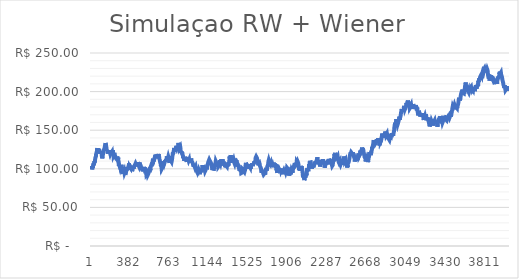
| Category | Fechamento |
|---|---|
| 0 | 100 |
| 1 | 100.678 |
| 2 | 101.698 |
| 3 | 103.433 |
| 4 | 103.872 |
| 5 | 103.301 |
| 6 | 101.942 |
| 7 | 103.253 |
| 8 | 103.356 |
| 9 | 101.671 |
| 10 | 101.156 |
| 11 | 99.206 |
| 12 | 100.505 |
| 13 | 101.097 |
| 14 | 102.596 |
| 15 | 101.179 |
| 16 | 101.984 |
| 17 | 101.192 |
| 18 | 102.281 |
| 19 | 103.791 |
| 20 | 104.23 |
| 21 | 105.191 |
| 22 | 104.655 |
| 23 | 105.236 |
| 24 | 105.897 |
| 25 | 107.164 |
| 26 | 106.026 |
| 27 | 106.317 |
| 28 | 104.596 |
| 29 | 106.191 |
| 30 | 106.873 |
| 31 | 107.87 |
| 32 | 109.868 |
| 33 | 109.879 |
| 34 | 110.602 |
| 35 | 109.348 |
| 36 | 108.08 |
| 37 | 108.624 |
| 38 | 110.357 |
| 39 | 111.676 |
| 40 | 113.385 |
| 41 | 112.103 |
| 42 | 113.96 |
| 43 | 114.763 |
| 44 | 116.02 |
| 45 | 115.441 |
| 46 | 114.342 |
| 47 | 116.233 |
| 48 | 117.494 |
| 49 | 119.403 |
| 50 | 118.268 |
| 51 | 119.61 |
| 52 | 118.437 |
| 53 | 118.722 |
| 54 | 120.002 |
| 55 | 121.327 |
| 56 | 122.898 |
| 57 | 124.658 |
| 58 | 124.891 |
| 59 | 125.276 |
| 60 | 124.724 |
| 61 | 126.733 |
| 62 | 124.752 |
| 63 | 125.297 |
| 64 | 125.624 |
| 65 | 126.227 |
| 66 | 125.505 |
| 67 | 123.505 |
| 68 | 123.481 |
| 69 | 124.017 |
| 70 | 125.82 |
| 71 | 125.696 |
| 72 | 126.794 |
| 73 | 125.202 |
| 74 | 124.043 |
| 75 | 125.571 |
| 76 | 124.817 |
| 77 | 123.172 |
| 78 | 123.15 |
| 79 | 121.484 |
| 80 | 123.319 |
| 81 | 123.75 |
| 82 | 122.032 |
| 83 | 120.021 |
| 84 | 121.251 |
| 85 | 122.398 |
| 86 | 121.001 |
| 87 | 122.127 |
| 88 | 122.635 |
| 89 | 121.314 |
| 90 | 119.693 |
| 91 | 119.584 |
| 92 | 121.089 |
| 93 | 121.943 |
| 94 | 122.648 |
| 95 | 122.152 |
| 96 | 121.419 |
| 97 | 119.929 |
| 98 | 121.319 |
| 99 | 122.203 |
| 100 | 121.799 |
| 101 | 120.358 |
| 102 | 119.289 |
| 103 | 117.47 |
| 104 | 116.641 |
| 105 | 115.022 |
| 106 | 115.317 |
| 107 | 115.263 |
| 108 | 113.5 |
| 109 | 113.595 |
| 110 | 114.258 |
| 111 | 115.963 |
| 112 | 114.995 |
| 113 | 116.836 |
| 114 | 118.106 |
| 115 | 119.317 |
| 116 | 120.338 |
| 117 | 120.739 |
| 118 | 121.987 |
| 119 | 123.675 |
| 120 | 124.17 |
| 121 | 122.577 |
| 122 | 123.824 |
| 123 | 123.644 |
| 124 | 124.126 |
| 125 | 124.169 |
| 126 | 123.494 |
| 127 | 124.7 |
| 128 | 124.592 |
| 129 | 126.154 |
| 130 | 125.215 |
| 131 | 126.536 |
| 132 | 127.904 |
| 133 | 129.175 |
| 134 | 129.635 |
| 135 | 129.026 |
| 136 | 129.745 |
| 137 | 131.734 |
| 138 | 131.52 |
| 139 | 133.255 |
| 140 | 133.114 |
| 141 | 132.006 |
| 142 | 132.341 |
| 143 | 131.65 |
| 144 | 131.845 |
| 145 | 130.958 |
| 146 | 129.075 |
| 147 | 128.301 |
| 148 | 128.096 |
| 149 | 126.454 |
| 150 | 126.36 |
| 151 | 124.354 |
| 152 | 123.926 |
| 153 | 123.682 |
| 154 | 123.106 |
| 155 | 123.586 |
| 156 | 123.882 |
| 157 | 123.043 |
| 158 | 121.801 |
| 159 | 121.133 |
| 160 | 120.658 |
| 161 | 119.582 |
| 162 | 119.525 |
| 163 | 120.611 |
| 164 | 122.016 |
| 165 | 123.812 |
| 166 | 123.919 |
| 167 | 123.904 |
| 168 | 122.64 |
| 169 | 121.194 |
| 170 | 122.015 |
| 171 | 122.46 |
| 172 | 123.958 |
| 173 | 123.42 |
| 174 | 121.669 |
| 175 | 120.943 |
| 176 | 122.401 |
| 177 | 121.894 |
| 178 | 121.79 |
| 179 | 120.042 |
| 180 | 121.715 |
| 181 | 122.954 |
| 182 | 121.709 |
| 183 | 120.311 |
| 184 | 120.822 |
| 185 | 119.559 |
| 186 | 121.342 |
| 187 | 122.167 |
| 188 | 124.16 |
| 189 | 122.864 |
| 190 | 123.287 |
| 191 | 121.409 |
| 192 | 120.084 |
| 193 | 118.855 |
| 194 | 120.482 |
| 195 | 121.276 |
| 196 | 121.236 |
| 197 | 119.39 |
| 198 | 119.529 |
| 199 | 119.344 |
| 200 | 120.293 |
| 201 | 121.98 |
| 202 | 120.338 |
| 203 | 119.539 |
| 204 | 120.787 |
| 205 | 122.228 |
| 206 | 123.287 |
| 207 | 124.089 |
| 208 | 122.245 |
| 209 | 123.197 |
| 210 | 124.138 |
| 211 | 122.376 |
| 212 | 120.406 |
| 213 | 120.23 |
| 214 | 119.335 |
| 215 | 118.673 |
| 216 | 116.996 |
| 217 | 117.19 |
| 218 | 115.978 |
| 219 | 116.497 |
| 220 | 117.972 |
| 221 | 117.925 |
| 222 | 118.659 |
| 223 | 120.413 |
| 224 | 119.272 |
| 225 | 120.896 |
| 226 | 120.001 |
| 227 | 118.43 |
| 228 | 119.283 |
| 229 | 118.588 |
| 230 | 118.789 |
| 231 | 117.953 |
| 232 | 116.86 |
| 233 | 115.868 |
| 234 | 114.472 |
| 235 | 114.636 |
| 236 | 113.908 |
| 237 | 113.442 |
| 238 | 114.552 |
| 239 | 115.023 |
| 240 | 113.21 |
| 241 | 113.61 |
| 242 | 114.024 |
| 243 | 114.531 |
| 244 | 112.897 |
| 245 | 114.494 |
| 246 | 113.009 |
| 247 | 114.684 |
| 248 | 113.835 |
| 249 | 114.776 |
| 250 | 113.97 |
| 251 | 112.842 |
| 252 | 114.422 |
| 253 | 115.983 |
| 254 | 114.115 |
| 255 | 112.88 |
| 256 | 114.476 |
| 257 | 114.174 |
| 258 | 114.126 |
| 259 | 112.158 |
| 260 | 113.082 |
| 261 | 114.289 |
| 262 | 112.528 |
| 263 | 111.77 |
| 264 | 109.868 |
| 265 | 107.977 |
| 266 | 106.122 |
| 267 | 105.386 |
| 268 | 103.635 |
| 269 | 104.582 |
| 270 | 104.697 |
| 271 | 105.289 |
| 272 | 105.017 |
| 273 | 105.058 |
| 274 | 104.432 |
| 275 | 105.569 |
| 276 | 104.296 |
| 277 | 102.745 |
| 278 | 103.075 |
| 279 | 103.952 |
| 280 | 104.048 |
| 281 | 102.261 |
| 282 | 102.8 |
| 283 | 101.281 |
| 284 | 100.495 |
| 285 | 101.096 |
| 286 | 100.281 |
| 287 | 99.254 |
| 288 | 99.382 |
| 289 | 100.991 |
| 290 | 101.343 |
| 291 | 103.136 |
| 292 | 105.097 |
| 293 | 106.072 |
| 294 | 104.701 |
| 295 | 103.056 |
| 296 | 103.959 |
| 297 | 102.441 |
| 298 | 102.994 |
| 299 | 101.899 |
| 300 | 100.193 |
| 301 | 98.364 |
| 302 | 99.041 |
| 303 | 97.882 |
| 304 | 96.909 |
| 305 | 95.324 |
| 306 | 96.058 |
| 307 | 95.244 |
| 308 | 93.301 |
| 309 | 94.058 |
| 310 | 94.832 |
| 311 | 96.516 |
| 312 | 95.335 |
| 313 | 94.525 |
| 314 | 95.308 |
| 315 | 95.839 |
| 316 | 96.086 |
| 317 | 96.428 |
| 318 | 95.999 |
| 319 | 97.221 |
| 320 | 97.516 |
| 321 | 96.437 |
| 322 | 94.709 |
| 323 | 94.537 |
| 324 | 95.909 |
| 325 | 95.209 |
| 326 | 96.07 |
| 327 | 94.293 |
| 328 | 93.274 |
| 329 | 92.465 |
| 330 | 93.17 |
| 331 | 91.964 |
| 332 | 92.412 |
| 333 | 93.691 |
| 334 | 93.083 |
| 335 | 95.03 |
| 336 | 96.886 |
| 337 | 95.073 |
| 338 | 96.628 |
| 339 | 97.829 |
| 340 | 99.687 |
| 341 | 99.156 |
| 342 | 97.607 |
| 343 | 99.17 |
| 344 | 100.164 |
| 345 | 100.195 |
| 346 | 101.966 |
| 347 | 100.863 |
| 348 | 98.891 |
| 349 | 98.866 |
| 350 | 98.46 |
| 351 | 98.593 |
| 352 | 100.56 |
| 353 | 98.874 |
| 354 | 100.776 |
| 355 | 99.552 |
| 356 | 99.912 |
| 357 | 100.919 |
| 358 | 100.138 |
| 359 | 101.367 |
| 360 | 101.311 |
| 361 | 101.979 |
| 362 | 103.825 |
| 363 | 103.895 |
| 364 | 105.274 |
| 365 | 105.626 |
| 366 | 106.967 |
| 367 | 105.874 |
| 368 | 104.508 |
| 369 | 103.606 |
| 370 | 103.504 |
| 371 | 101.593 |
| 372 | 103.279 |
| 373 | 102.827 |
| 374 | 103.884 |
| 375 | 103.745 |
| 376 | 104.019 |
| 377 | 103.505 |
| 378 | 101.975 |
| 379 | 103.786 |
| 380 | 104.947 |
| 381 | 102.995 |
| 382 | 104.001 |
| 383 | 103.55 |
| 384 | 103.137 |
| 385 | 101.494 |
| 386 | 101.063 |
| 387 | 100.684 |
| 388 | 98.957 |
| 389 | 100.939 |
| 390 | 101.096 |
| 391 | 100.424 |
| 392 | 100.344 |
| 393 | 99.048 |
| 394 | 98.168 |
| 395 | 96.95 |
| 396 | 97.033 |
| 397 | 98.192 |
| 398 | 96.261 |
| 399 | 97.64 |
| 400 | 99.63 |
| 401 | 101.349 |
| 402 | 101.794 |
| 403 | 102.04 |
| 404 | 103.687 |
| 405 | 103.256 |
| 406 | 102.96 |
| 407 | 102.144 |
| 408 | 100.249 |
| 409 | 102.17 |
| 410 | 100.546 |
| 411 | 99.665 |
| 412 | 101.631 |
| 413 | 102.461 |
| 414 | 102.608 |
| 415 | 102.731 |
| 416 | 102.119 |
| 417 | 102.342 |
| 418 | 102.771 |
| 419 | 103.988 |
| 420 | 105.091 |
| 421 | 103.318 |
| 422 | 105.036 |
| 423 | 104.325 |
| 424 | 104.818 |
| 425 | 104.128 |
| 426 | 105.115 |
| 427 | 104.836 |
| 428 | 106.728 |
| 429 | 107.63 |
| 430 | 107.464 |
| 431 | 106.636 |
| 432 | 105.366 |
| 433 | 106.554 |
| 434 | 108.141 |
| 435 | 107.677 |
| 436 | 108.383 |
| 437 | 107.741 |
| 438 | 108.031 |
| 439 | 106.224 |
| 440 | 108.121 |
| 441 | 106.625 |
| 442 | 104.938 |
| 443 | 106.175 |
| 444 | 104.396 |
| 445 | 103.032 |
| 446 | 104.275 |
| 447 | 105.123 |
| 448 | 106.698 |
| 449 | 108.358 |
| 450 | 108.797 |
| 451 | 107.217 |
| 452 | 108.677 |
| 453 | 109.178 |
| 454 | 107.651 |
| 455 | 106.29 |
| 456 | 104.865 |
| 457 | 104.832 |
| 458 | 104.2 |
| 459 | 105.162 |
| 460 | 104.157 |
| 461 | 103.362 |
| 462 | 103.549 |
| 463 | 103.522 |
| 464 | 102.674 |
| 465 | 104.618 |
| 466 | 106.569 |
| 467 | 108.195 |
| 468 | 107.67 |
| 469 | 106.054 |
| 470 | 105.576 |
| 471 | 105.146 |
| 472 | 105.527 |
| 473 | 106.6 |
| 474 | 106.99 |
| 475 | 106.347 |
| 476 | 106.596 |
| 477 | 105.158 |
| 478 | 104.179 |
| 479 | 104.019 |
| 480 | 102.644 |
| 481 | 102.278 |
| 482 | 102.119 |
| 483 | 100.206 |
| 484 | 99.972 |
| 485 | 98.631 |
| 486 | 98.526 |
| 487 | 99.674 |
| 488 | 101.09 |
| 489 | 99.975 |
| 490 | 100.637 |
| 491 | 99.644 |
| 492 | 100.739 |
| 493 | 102.574 |
| 494 | 100.592 |
| 495 | 98.985 |
| 496 | 97.826 |
| 497 | 96.613 |
| 498 | 96.297 |
| 499 | 98.242 |
| 500 | 97.68 |
| 501 | 97.203 |
| 502 | 97.079 |
| 503 | 98.018 |
| 504 | 98.75 |
| 505 | 100.269 |
| 506 | 102.042 |
| 507 | 102.2 |
| 508 | 102.671 |
| 509 | 102.256 |
| 510 | 102.009 |
| 511 | 100.514 |
| 512 | 99.708 |
| 513 | 100.658 |
| 514 | 99.77 |
| 515 | 98.858 |
| 516 | 100.587 |
| 517 | 98.679 |
| 518 | 99.877 |
| 519 | 101.611 |
| 520 | 100.458 |
| 521 | 99.248 |
| 522 | 97.811 |
| 523 | 96.93 |
| 524 | 95.345 |
| 525 | 93.993 |
| 526 | 94.957 |
| 527 | 94.605 |
| 528 | 94.354 |
| 529 | 95.008 |
| 530 | 96.557 |
| 531 | 94.626 |
| 532 | 93.305 |
| 533 | 94.323 |
| 534 | 93.747 |
| 535 | 92.679 |
| 536 | 93.109 |
| 537 | 93.841 |
| 538 | 92.98 |
| 539 | 93.844 |
| 540 | 94.402 |
| 541 | 95.309 |
| 542 | 93.711 |
| 543 | 92.683 |
| 544 | 93.3 |
| 545 | 91.78 |
| 546 | 90.701 |
| 547 | 92.278 |
| 548 | 92.66 |
| 549 | 91.834 |
| 550 | 91.438 |
| 551 | 91.229 |
| 552 | 92.87 |
| 553 | 92.438 |
| 554 | 94.308 |
| 555 | 95.63 |
| 556 | 96.194 |
| 557 | 96.741 |
| 558 | 98.715 |
| 559 | 97.465 |
| 560 | 98.252 |
| 561 | 97.58 |
| 562 | 95.756 |
| 563 | 97.029 |
| 564 | 96.757 |
| 565 | 97.6 |
| 566 | 99.427 |
| 567 | 100.344 |
| 568 | 101.641 |
| 569 | 100.19 |
| 570 | 99.21 |
| 571 | 97.853 |
| 572 | 99.534 |
| 573 | 100.031 |
| 574 | 101.998 |
| 575 | 102.071 |
| 576 | 101.991 |
| 577 | 103.431 |
| 578 | 104.204 |
| 579 | 104.21 |
| 580 | 104.621 |
| 581 | 104.148 |
| 582 | 105.055 |
| 583 | 105.888 |
| 584 | 104.781 |
| 585 | 106.309 |
| 586 | 107.507 |
| 587 | 106.086 |
| 588 | 106.84 |
| 589 | 107.879 |
| 590 | 106.782 |
| 591 | 106.141 |
| 592 | 107.33 |
| 593 | 109.01 |
| 594 | 110.287 |
| 595 | 111.276 |
| 596 | 113.081 |
| 597 | 111.606 |
| 598 | 111.636 |
| 599 | 111.096 |
| 600 | 110.411 |
| 601 | 110.196 |
| 602 | 110.941 |
| 603 | 110.707 |
| 604 | 111.565 |
| 605 | 110.992 |
| 606 | 109.733 |
| 607 | 110.466 |
| 608 | 112.441 |
| 609 | 112.218 |
| 610 | 112.617 |
| 611 | 113.377 |
| 612 | 113.382 |
| 613 | 112.777 |
| 614 | 114.762 |
| 615 | 114.828 |
| 616 | 114.757 |
| 617 | 115.848 |
| 618 | 116.907 |
| 619 | 116.517 |
| 620 | 116.298 |
| 621 | 118.269 |
| 622 | 117.895 |
| 623 | 116.364 |
| 624 | 115.091 |
| 625 | 113.539 |
| 626 | 115.275 |
| 627 | 116.217 |
| 628 | 115.985 |
| 629 | 114.19 |
| 630 | 115.605 |
| 631 | 116.208 |
| 632 | 117.051 |
| 633 | 118.247 |
| 634 | 118.462 |
| 635 | 118.958 |
| 636 | 118.42 |
| 637 | 116.795 |
| 638 | 116.082 |
| 639 | 114.529 |
| 640 | 114.603 |
| 641 | 115.613 |
| 642 | 117.4 |
| 643 | 118.995 |
| 644 | 120.038 |
| 645 | 119.311 |
| 646 | 118.61 |
| 647 | 116.941 |
| 648 | 116.366 |
| 649 | 117.795 |
| 650 | 118.041 |
| 651 | 118.998 |
| 652 | 117.015 |
| 653 | 116.861 |
| 654 | 115.947 |
| 655 | 116.825 |
| 656 | 115.396 |
| 657 | 114.237 |
| 658 | 112.711 |
| 659 | 112.086 |
| 660 | 112.599 |
| 661 | 112.736 |
| 662 | 111.213 |
| 663 | 111.408 |
| 664 | 110.885 |
| 665 | 108.982 |
| 666 | 109.167 |
| 667 | 108.115 |
| 668 | 109.433 |
| 669 | 107.687 |
| 670 | 107.813 |
| 671 | 105.999 |
| 672 | 104.375 |
| 673 | 104.791 |
| 674 | 103.509 |
| 675 | 104.565 |
| 676 | 104.246 |
| 677 | 103.203 |
| 678 | 102.779 |
| 679 | 101.216 |
| 680 | 99.801 |
| 681 | 100.858 |
| 682 | 100.663 |
| 683 | 99.624 |
| 684 | 100.607 |
| 685 | 99.974 |
| 686 | 99.64 |
| 687 | 100.674 |
| 688 | 101.899 |
| 689 | 103.548 |
| 690 | 104.053 |
| 691 | 104.489 |
| 692 | 103.809 |
| 693 | 105.617 |
| 694 | 103.681 |
| 695 | 104.936 |
| 696 | 105.353 |
| 697 | 105.845 |
| 698 | 107.754 |
| 699 | 108.854 |
| 700 | 109.811 |
| 701 | 110.174 |
| 702 | 108.249 |
| 703 | 106.989 |
| 704 | 108.259 |
| 705 | 106.756 |
| 706 | 107.493 |
| 707 | 107.638 |
| 708 | 107.187 |
| 709 | 108.393 |
| 710 | 108.09 |
| 711 | 108.967 |
| 712 | 109.412 |
| 713 | 110.831 |
| 714 | 110.052 |
| 715 | 110.835 |
| 716 | 110.412 |
| 717 | 109.127 |
| 718 | 110.675 |
| 719 | 109.716 |
| 720 | 110.668 |
| 721 | 110.244 |
| 722 | 111.429 |
| 723 | 111.863 |
| 724 | 109.887 |
| 725 | 109.93 |
| 726 | 110.413 |
| 727 | 111.069 |
| 728 | 113.107 |
| 729 | 114.493 |
| 730 | 116.308 |
| 731 | 116.342 |
| 732 | 116.212 |
| 733 | 117.491 |
| 734 | 116.391 |
| 735 | 116.435 |
| 736 | 115.013 |
| 737 | 113.252 |
| 738 | 114.557 |
| 739 | 113.004 |
| 740 | 113.558 |
| 741 | 114.248 |
| 742 | 113.916 |
| 743 | 113.81 |
| 744 | 115.717 |
| 745 | 115.887 |
| 746 | 115.377 |
| 747 | 114.361 |
| 748 | 113.738 |
| 749 | 113.291 |
| 750 | 113.359 |
| 751 | 111.361 |
| 752 | 112.753 |
| 753 | 110.781 |
| 754 | 109.21 |
| 755 | 107.478 |
| 756 | 106.602 |
| 757 | 108.223 |
| 758 | 110.074 |
| 759 | 111.669 |
| 760 | 112.001 |
| 761 | 110.15 |
| 762 | 111.667 |
| 763 | 112.672 |
| 764 | 114.578 |
| 765 | 116.439 |
| 766 | 116.505 |
| 767 | 115.358 |
| 768 | 113.762 |
| 769 | 114.05 |
| 770 | 112.634 |
| 771 | 110.822 |
| 772 | 110.665 |
| 773 | 110.939 |
| 774 | 109.646 |
| 775 | 110.207 |
| 776 | 109.496 |
| 777 | 108.859 |
| 778 | 110.481 |
| 779 | 111.607 |
| 780 | 112.877 |
| 781 | 113.564 |
| 782 | 114.896 |
| 783 | 115.014 |
| 784 | 116.753 |
| 785 | 116.019 |
| 786 | 117.45 |
| 787 | 118.95 |
| 788 | 120.943 |
| 789 | 119.188 |
| 790 | 119.903 |
| 791 | 118.653 |
| 792 | 120.674 |
| 793 | 121.83 |
| 794 | 119.997 |
| 795 | 120.865 |
| 796 | 122.706 |
| 797 | 122.513 |
| 798 | 123.496 |
| 799 | 125.104 |
| 800 | 127.095 |
| 801 | 125.947 |
| 802 | 125.283 |
| 803 | 125.721 |
| 804 | 125.34 |
| 805 | 125.49 |
| 806 | 125.262 |
| 807 | 123.573 |
| 808 | 121.738 |
| 809 | 123.341 |
| 810 | 123.372 |
| 811 | 122.235 |
| 812 | 123.177 |
| 813 | 122.684 |
| 814 | 123.969 |
| 815 | 125.453 |
| 816 | 126.045 |
| 817 | 126.202 |
| 818 | 126.376 |
| 819 | 127.741 |
| 820 | 127.604 |
| 821 | 128.269 |
| 822 | 128.95 |
| 823 | 129.78 |
| 824 | 128.336 |
| 825 | 127.103 |
| 826 | 128.211 |
| 827 | 127.008 |
| 828 | 126.97 |
| 829 | 128.283 |
| 830 | 127.978 |
| 831 | 127.724 |
| 832 | 128.845 |
| 833 | 127.872 |
| 834 | 127.247 |
| 835 | 127.961 |
| 836 | 128.404 |
| 837 | 126.954 |
| 838 | 128.771 |
| 839 | 130.429 |
| 840 | 131.7 |
| 841 | 133.494 |
| 842 | 133.074 |
| 843 | 133.194 |
| 844 | 132.152 |
| 845 | 131.082 |
| 846 | 130.327 |
| 847 | 130.949 |
| 848 | 130.609 |
| 849 | 130.818 |
| 850 | 130.099 |
| 851 | 128.478 |
| 852 | 126.732 |
| 853 | 125.901 |
| 854 | 127.156 |
| 855 | 126.718 |
| 856 | 127.567 |
| 857 | 125.814 |
| 858 | 127.535 |
| 859 | 128.42 |
| 860 | 127.719 |
| 861 | 126.732 |
| 862 | 125.065 |
| 863 | 123.657 |
| 864 | 124.178 |
| 865 | 122.36 |
| 866 | 123.21 |
| 867 | 123.023 |
| 868 | 121.19 |
| 869 | 122.417 |
| 870 | 122.294 |
| 871 | 122.233 |
| 872 | 122.198 |
| 873 | 120.801 |
| 874 | 121.358 |
| 875 | 121.919 |
| 876 | 122.152 |
| 877 | 122.082 |
| 878 | 121.084 |
| 879 | 119.321 |
| 880 | 118.792 |
| 881 | 119.78 |
| 882 | 119.691 |
| 883 | 118.248 |
| 884 | 118.468 |
| 885 | 116.791 |
| 886 | 115.843 |
| 887 | 113.873 |
| 888 | 115.563 |
| 889 | 115.282 |
| 890 | 115.339 |
| 891 | 116.481 |
| 892 | 114.859 |
| 893 | 113.821 |
| 894 | 113.093 |
| 895 | 115.055 |
| 896 | 113.299 |
| 897 | 111.984 |
| 898 | 110.122 |
| 899 | 112.158 |
| 900 | 111.722 |
| 901 | 112.015 |
| 902 | 111.317 |
| 903 | 111.774 |
| 904 | 113.366 |
| 905 | 112.99 |
| 906 | 113.056 |
| 907 | 111.285 |
| 908 | 111.939 |
| 909 | 112.776 |
| 910 | 110.91 |
| 911 | 109.909 |
| 912 | 111.446 |
| 913 | 111.001 |
| 914 | 112.846 |
| 915 | 114.69 |
| 916 | 114.155 |
| 917 | 113.273 |
| 918 | 112.204 |
| 919 | 110.47 |
| 920 | 110.768 |
| 921 | 108.841 |
| 922 | 110.747 |
| 923 | 112.078 |
| 924 | 111.402 |
| 925 | 111.996 |
| 926 | 112.387 |
| 927 | 113.22 |
| 928 | 114.267 |
| 929 | 112.601 |
| 930 | 114.46 |
| 931 | 112.931 |
| 932 | 112.899 |
| 933 | 113.78 |
| 934 | 114.861 |
| 935 | 113.479 |
| 936 | 112.39 |
| 937 | 111.965 |
| 938 | 111.254 |
| 939 | 111.592 |
| 940 | 110.571 |
| 941 | 109.493 |
| 942 | 109.444 |
| 943 | 111.414 |
| 944 | 110.54 |
| 945 | 112.119 |
| 946 | 111.507 |
| 947 | 110.99 |
| 948 | 109.654 |
| 949 | 110.331 |
| 950 | 108.334 |
| 951 | 108.639 |
| 952 | 107.864 |
| 953 | 107.61 |
| 954 | 109.542 |
| 955 | 111.111 |
| 956 | 109.455 |
| 957 | 110.371 |
| 958 | 108.605 |
| 959 | 110.063 |
| 960 | 110.095 |
| 961 | 111.398 |
| 962 | 110.445 |
| 963 | 111.63 |
| 964 | 113.397 |
| 965 | 112.643 |
| 966 | 111.314 |
| 967 | 111.71 |
| 968 | 111.844 |
| 969 | 109.842 |
| 970 | 110.668 |
| 971 | 109.149 |
| 972 | 108.812 |
| 973 | 108.851 |
| 974 | 109.551 |
| 975 | 110.421 |
| 976 | 108.548 |
| 977 | 107.933 |
| 978 | 107.619 |
| 979 | 106.814 |
| 980 | 107.397 |
| 981 | 107.712 |
| 982 | 106.11 |
| 983 | 104.8 |
| 984 | 104.7 |
| 985 | 105.739 |
| 986 | 105.958 |
| 987 | 105.475 |
| 988 | 103.892 |
| 989 | 105.273 |
| 990 | 104.319 |
| 991 | 104.345 |
| 992 | 104.03 |
| 993 | 104.39 |
| 994 | 103.931 |
| 995 | 103.253 |
| 996 | 103.098 |
| 997 | 103.066 |
| 998 | 103.861 |
| 999 | 102.486 |
| 1000 | 103.72 |
| 1001 | 102.996 |
| 1002 | 101.146 |
| 1003 | 101.887 |
| 1004 | 100.666 |
| 1005 | 102.053 |
| 1006 | 101.293 |
| 1007 | 101.772 |
| 1008 | 102.865 |
| 1009 | 102.251 |
| 1010 | 102.771 |
| 1011 | 100.855 |
| 1012 | 98.874 |
| 1013 | 99.972 |
| 1014 | 98.077 |
| 1015 | 99.522 |
| 1016 | 99.336 |
| 1017 | 97.383 |
| 1018 | 98.088 |
| 1019 | 99.717 |
| 1020 | 98.918 |
| 1021 | 99.732 |
| 1022 | 98.87 |
| 1023 | 99.759 |
| 1024 | 100.716 |
| 1025 | 100.208 |
| 1026 | 99.134 |
| 1027 | 97.866 |
| 1028 | 98.544 |
| 1029 | 100.329 |
| 1030 | 98.559 |
| 1031 | 97.118 |
| 1032 | 96.043 |
| 1033 | 97.146 |
| 1034 | 95.398 |
| 1035 | 93.793 |
| 1036 | 95.393 |
| 1037 | 95.688 |
| 1038 | 96.176 |
| 1039 | 97.324 |
| 1040 | 96.631 |
| 1041 | 98.257 |
| 1042 | 98.301 |
| 1043 | 97.44 |
| 1044 | 96.142 |
| 1045 | 94.929 |
| 1046 | 94.233 |
| 1047 | 92.935 |
| 1048 | 94.592 |
| 1049 | 93.94 |
| 1050 | 95.808 |
| 1051 | 96.57 |
| 1052 | 95.318 |
| 1053 | 96.218 |
| 1054 | 98.251 |
| 1055 | 96.846 |
| 1056 | 97.241 |
| 1057 | 95.996 |
| 1058 | 97.018 |
| 1059 | 97.687 |
| 1060 | 96.946 |
| 1061 | 96.043 |
| 1062 | 97.67 |
| 1063 | 96.604 |
| 1064 | 96.936 |
| 1065 | 97.29 |
| 1066 | 98.421 |
| 1067 | 97.311 |
| 1068 | 98.204 |
| 1069 | 100.11 |
| 1070 | 100.632 |
| 1071 | 101.786 |
| 1072 | 102.591 |
| 1073 | 103.389 |
| 1074 | 104.742 |
| 1075 | 103.394 |
| 1076 | 103.289 |
| 1077 | 102.799 |
| 1078 | 102.292 |
| 1079 | 101.603 |
| 1080 | 101.89 |
| 1081 | 103.156 |
| 1082 | 104.716 |
| 1083 | 105.423 |
| 1084 | 104.072 |
| 1085 | 104.633 |
| 1086 | 103.195 |
| 1087 | 102.095 |
| 1088 | 102.859 |
| 1089 | 104.034 |
| 1090 | 102.98 |
| 1091 | 103.056 |
| 1092 | 102.256 |
| 1093 | 100.5 |
| 1094 | 101.416 |
| 1095 | 100.126 |
| 1096 | 98.266 |
| 1097 | 97.445 |
| 1098 | 96.907 |
| 1099 | 97.125 |
| 1100 | 96.24 |
| 1101 | 96.604 |
| 1102 | 97.607 |
| 1103 | 98.315 |
| 1104 | 100.026 |
| 1105 | 101.411 |
| 1106 | 102.882 |
| 1107 | 101.366 |
| 1108 | 99.805 |
| 1109 | 100.764 |
| 1110 | 102.561 |
| 1111 | 101.618 |
| 1112 | 100.756 |
| 1113 | 102.329 |
| 1114 | 102.145 |
| 1115 | 100.982 |
| 1116 | 99.413 |
| 1117 | 99.826 |
| 1118 | 101.802 |
| 1119 | 102.299 |
| 1120 | 104.015 |
| 1121 | 104.629 |
| 1122 | 104.366 |
| 1123 | 103.619 |
| 1124 | 105.488 |
| 1125 | 106.804 |
| 1126 | 106.141 |
| 1127 | 106.979 |
| 1128 | 106.004 |
| 1129 | 107.57 |
| 1130 | 109.113 |
| 1131 | 110.088 |
| 1132 | 108.955 |
| 1133 | 108.51 |
| 1134 | 108.2 |
| 1135 | 109.927 |
| 1136 | 109.97 |
| 1137 | 110.069 |
| 1138 | 111.869 |
| 1139 | 112.828 |
| 1140 | 112.009 |
| 1141 | 111.794 |
| 1142 | 111.397 |
| 1143 | 111.246 |
| 1144 | 110.169 |
| 1145 | 108.549 |
| 1146 | 109.938 |
| 1147 | 110.463 |
| 1148 | 108.702 |
| 1149 | 109.574 |
| 1150 | 108.324 |
| 1151 | 109.269 |
| 1152 | 108.178 |
| 1153 | 108.412 |
| 1154 | 108.268 |
| 1155 | 107.981 |
| 1156 | 106.915 |
| 1157 | 107.764 |
| 1158 | 106.268 |
| 1159 | 106.633 |
| 1160 | 104.759 |
| 1161 | 106.634 |
| 1162 | 104.739 |
| 1163 | 103.13 |
| 1164 | 103.584 |
| 1165 | 101.986 |
| 1166 | 102.301 |
| 1167 | 100.48 |
| 1168 | 99.329 |
| 1169 | 98.435 |
| 1170 | 99.738 |
| 1171 | 101.66 |
| 1172 | 101.349 |
| 1173 | 103.203 |
| 1174 | 101.6 |
| 1175 | 102.45 |
| 1176 | 101.38 |
| 1177 | 100.692 |
| 1178 | 99.579 |
| 1179 | 97.823 |
| 1180 | 96.931 |
| 1181 | 98.362 |
| 1182 | 99.407 |
| 1183 | 100.819 |
| 1184 | 102.412 |
| 1185 | 100.4 |
| 1186 | 99.87 |
| 1187 | 101.76 |
| 1188 | 102.683 |
| 1189 | 104.321 |
| 1190 | 104.268 |
| 1191 | 105.42 |
| 1192 | 103.71 |
| 1193 | 102.717 |
| 1194 | 102.842 |
| 1195 | 104.44 |
| 1196 | 104.887 |
| 1197 | 105.09 |
| 1198 | 106.889 |
| 1199 | 107.987 |
| 1200 | 107.952 |
| 1201 | 109.74 |
| 1202 | 109.425 |
| 1203 | 110.132 |
| 1204 | 109.975 |
| 1205 | 108.444 |
| 1206 | 107.546 |
| 1207 | 106.23 |
| 1208 | 107.217 |
| 1209 | 107.785 |
| 1210 | 106.684 |
| 1211 | 105.905 |
| 1212 | 105.932 |
| 1213 | 106.01 |
| 1214 | 104.345 |
| 1215 | 103.239 |
| 1216 | 102.817 |
| 1217 | 103.485 |
| 1218 | 105.505 |
| 1219 | 103.763 |
| 1220 | 104.532 |
| 1221 | 105.176 |
| 1222 | 104.728 |
| 1223 | 103.858 |
| 1224 | 102.555 |
| 1225 | 102.454 |
| 1226 | 102.854 |
| 1227 | 103.276 |
| 1228 | 103.444 |
| 1229 | 102.921 |
| 1230 | 102.888 |
| 1231 | 102.307 |
| 1232 | 104.11 |
| 1233 | 103.443 |
| 1234 | 105.058 |
| 1235 | 105.898 |
| 1236 | 107.645 |
| 1237 | 108.779 |
| 1238 | 109.431 |
| 1239 | 109.647 |
| 1240 | 111.017 |
| 1241 | 110.569 |
| 1242 | 110.217 |
| 1243 | 109.054 |
| 1244 | 108.865 |
| 1245 | 108.022 |
| 1246 | 109.24 |
| 1247 | 107.477 |
| 1248 | 108.147 |
| 1249 | 106.533 |
| 1250 | 108.27 |
| 1251 | 110.083 |
| 1252 | 110.212 |
| 1253 | 112.207 |
| 1254 | 111.352 |
| 1255 | 109.991 |
| 1256 | 109.65 |
| 1257 | 109.826 |
| 1258 | 109.433 |
| 1259 | 107.852 |
| 1260 | 109.437 |
| 1261 | 109.042 |
| 1262 | 110.889 |
| 1263 | 109.928 |
| 1264 | 109.345 |
| 1265 | 110.245 |
| 1266 | 112.22 |
| 1267 | 110.511 |
| 1268 | 109.6 |
| 1269 | 109.618 |
| 1270 | 108.02 |
| 1271 | 108.54 |
| 1272 | 108.734 |
| 1273 | 109.418 |
| 1274 | 107.62 |
| 1275 | 107.503 |
| 1276 | 107.643 |
| 1277 | 106.247 |
| 1278 | 107.494 |
| 1279 | 106.038 |
| 1280 | 104.209 |
| 1281 | 104.784 |
| 1282 | 106.218 |
| 1283 | 106.542 |
| 1284 | 108.224 |
| 1285 | 106.55 |
| 1286 | 105.022 |
| 1287 | 105.255 |
| 1288 | 106.104 |
| 1289 | 105.835 |
| 1290 | 104.57 |
| 1291 | 103.051 |
| 1292 | 105.029 |
| 1293 | 104.301 |
| 1294 | 103.497 |
| 1295 | 102.458 |
| 1296 | 101.682 |
| 1297 | 101.2 |
| 1298 | 102.246 |
| 1299 | 101.073 |
| 1300 | 102.879 |
| 1301 | 104.364 |
| 1302 | 105.406 |
| 1303 | 105.506 |
| 1304 | 105.54 |
| 1305 | 103.644 |
| 1306 | 103.768 |
| 1307 | 105.003 |
| 1308 | 104.18 |
| 1309 | 102.932 |
| 1310 | 102.124 |
| 1311 | 103.36 |
| 1312 | 105.339 |
| 1313 | 104.569 |
| 1314 | 104.737 |
| 1315 | 104.607 |
| 1316 | 103.505 |
| 1317 | 103.085 |
| 1318 | 103.029 |
| 1319 | 103.925 |
| 1320 | 105.814 |
| 1321 | 103.936 |
| 1322 | 103.571 |
| 1323 | 105.179 |
| 1324 | 106.78 |
| 1325 | 105.983 |
| 1326 | 107.501 |
| 1327 | 106.152 |
| 1328 | 106.514 |
| 1329 | 106.749 |
| 1330 | 107.451 |
| 1331 | 109.266 |
| 1332 | 111.159 |
| 1333 | 112.707 |
| 1334 | 114.104 |
| 1335 | 115.983 |
| 1336 | 114.384 |
| 1337 | 113.27 |
| 1338 | 111.349 |
| 1339 | 111.619 |
| 1340 | 111.703 |
| 1341 | 112.857 |
| 1342 | 114.108 |
| 1343 | 115.701 |
| 1344 | 116.455 |
| 1345 | 117.719 |
| 1346 | 115.916 |
| 1347 | 116.15 |
| 1348 | 116.434 |
| 1349 | 114.509 |
| 1350 | 114.743 |
| 1351 | 112.853 |
| 1352 | 112.794 |
| 1353 | 111.977 |
| 1354 | 111.001 |
| 1355 | 112.77 |
| 1356 | 113.496 |
| 1357 | 112.701 |
| 1358 | 112.042 |
| 1359 | 110.164 |
| 1360 | 111.749 |
| 1361 | 110.608 |
| 1362 | 109.963 |
| 1363 | 108.718 |
| 1364 | 109.688 |
| 1365 | 107.854 |
| 1366 | 107.04 |
| 1367 | 108.378 |
| 1368 | 107.822 |
| 1369 | 108.19 |
| 1370 | 110.069 |
| 1371 | 109.717 |
| 1372 | 110.732 |
| 1373 | 109.792 |
| 1374 | 111.667 |
| 1375 | 112.585 |
| 1376 | 111.109 |
| 1377 | 110.085 |
| 1378 | 108.346 |
| 1379 | 108.318 |
| 1380 | 108.357 |
| 1381 | 107.863 |
| 1382 | 106.913 |
| 1383 | 106.15 |
| 1384 | 107.86 |
| 1385 | 108.714 |
| 1386 | 109.876 |
| 1387 | 111.596 |
| 1388 | 112.296 |
| 1389 | 113.213 |
| 1390 | 111.904 |
| 1391 | 110.494 |
| 1392 | 110.598 |
| 1393 | 110.983 |
| 1394 | 109.16 |
| 1395 | 108.785 |
| 1396 | 109.638 |
| 1397 | 109.644 |
| 1398 | 109.146 |
| 1399 | 109.895 |
| 1400 | 108.687 |
| 1401 | 109.819 |
| 1402 | 108.401 |
| 1403 | 110.271 |
| 1404 | 108.973 |
| 1405 | 107.049 |
| 1406 | 105.123 |
| 1407 | 105.596 |
| 1408 | 107.104 |
| 1409 | 106.615 |
| 1410 | 108.261 |
| 1411 | 106.483 |
| 1412 | 106.536 |
| 1413 | 107.721 |
| 1414 | 105.748 |
| 1415 | 104.713 |
| 1416 | 102.702 |
| 1417 | 101.776 |
| 1418 | 103.733 |
| 1419 | 104.969 |
| 1420 | 105.904 |
| 1421 | 104.163 |
| 1422 | 102.52 |
| 1423 | 101.692 |
| 1424 | 100.254 |
| 1425 | 99.494 |
| 1426 | 101.185 |
| 1427 | 101.796 |
| 1428 | 101.427 |
| 1429 | 100.946 |
| 1430 | 99.048 |
| 1431 | 97.41 |
| 1432 | 98.914 |
| 1433 | 98.228 |
| 1434 | 97.957 |
| 1435 | 99.671 |
| 1436 | 101.152 |
| 1437 | 99.661 |
| 1438 | 99.783 |
| 1439 | 97.875 |
| 1440 | 99.005 |
| 1441 | 97.52 |
| 1442 | 96.268 |
| 1443 | 96.166 |
| 1444 | 97.582 |
| 1445 | 95.959 |
| 1446 | 94.403 |
| 1447 | 93.384 |
| 1448 | 94.183 |
| 1449 | 95.687 |
| 1450 | 94.788 |
| 1451 | 94.31 |
| 1452 | 95.5 |
| 1453 | 95.279 |
| 1454 | 94.119 |
| 1455 | 95.421 |
| 1456 | 95.163 |
| 1457 | 97.127 |
| 1458 | 98.375 |
| 1459 | 99.551 |
| 1460 | 100.34 |
| 1461 | 99.269 |
| 1462 | 98.413 |
| 1463 | 99.448 |
| 1464 | 99.534 |
| 1465 | 99.717 |
| 1466 | 100.026 |
| 1467 | 100.073 |
| 1468 | 98.237 |
| 1469 | 99.005 |
| 1470 | 99.498 |
| 1471 | 98.963 |
| 1472 | 98.799 |
| 1473 | 98.313 |
| 1474 | 99.408 |
| 1475 | 98.804 |
| 1476 | 97.985 |
| 1477 | 97.286 |
| 1478 | 96.099 |
| 1479 | 95.955 |
| 1480 | 95.573 |
| 1481 | 95.769 |
| 1482 | 97.324 |
| 1483 | 98.373 |
| 1484 | 98.94 |
| 1485 | 99.963 |
| 1486 | 100.856 |
| 1487 | 102.859 |
| 1488 | 104.267 |
| 1489 | 105.689 |
| 1490 | 106.947 |
| 1491 | 107.791 |
| 1492 | 107.012 |
| 1493 | 108.11 |
| 1494 | 108.853 |
| 1495 | 108.516 |
| 1496 | 108.179 |
| 1497 | 107.05 |
| 1498 | 105.388 |
| 1499 | 103.506 |
| 1500 | 101.729 |
| 1501 | 100.708 |
| 1502 | 100.061 |
| 1503 | 99.939 |
| 1504 | 100.567 |
| 1505 | 102.291 |
| 1506 | 101.981 |
| 1507 | 100.857 |
| 1508 | 101.841 |
| 1509 | 103.254 |
| 1510 | 102.195 |
| 1511 | 100.436 |
| 1512 | 100.345 |
| 1513 | 100.643 |
| 1514 | 101.602 |
| 1515 | 103.532 |
| 1516 | 103.675 |
| 1517 | 104.959 |
| 1518 | 102.995 |
| 1519 | 101.66 |
| 1520 | 103.633 |
| 1521 | 104.675 |
| 1522 | 106.217 |
| 1523 | 104.803 |
| 1524 | 105.897 |
| 1525 | 104.425 |
| 1526 | 103.386 |
| 1527 | 104.087 |
| 1528 | 104.403 |
| 1529 | 103.011 |
| 1530 | 103.095 |
| 1531 | 102.976 |
| 1532 | 101.966 |
| 1533 | 103.565 |
| 1534 | 103.114 |
| 1535 | 101.558 |
| 1536 | 101.864 |
| 1537 | 101.448 |
| 1538 | 99.846 |
| 1539 | 101.424 |
| 1540 | 103.166 |
| 1541 | 101.755 |
| 1542 | 103.234 |
| 1543 | 102.829 |
| 1544 | 103.035 |
| 1545 | 104.66 |
| 1546 | 103.743 |
| 1547 | 104.575 |
| 1548 | 106.33 |
| 1549 | 104.74 |
| 1550 | 105.195 |
| 1551 | 105.205 |
| 1552 | 106.58 |
| 1553 | 105.139 |
| 1554 | 103.897 |
| 1555 | 104.523 |
| 1556 | 105.05 |
| 1557 | 106.953 |
| 1558 | 105.276 |
| 1559 | 103.544 |
| 1560 | 105.344 |
| 1561 | 104.146 |
| 1562 | 104.522 |
| 1563 | 106.216 |
| 1564 | 106.529 |
| 1565 | 104.553 |
| 1566 | 104.156 |
| 1567 | 105.336 |
| 1568 | 105.501 |
| 1569 | 106.331 |
| 1570 | 107.68 |
| 1571 | 106.782 |
| 1572 | 108.475 |
| 1573 | 109.039 |
| 1574 | 108.379 |
| 1575 | 107.444 |
| 1576 | 108.194 |
| 1577 | 109.898 |
| 1578 | 107.961 |
| 1579 | 109.115 |
| 1580 | 109.662 |
| 1581 | 109.374 |
| 1582 | 110.866 |
| 1583 | 111.312 |
| 1584 | 112.563 |
| 1585 | 114.385 |
| 1586 | 115.319 |
| 1587 | 115.318 |
| 1588 | 114.289 |
| 1589 | 115.337 |
| 1590 | 115.822 |
| 1591 | 116 |
| 1592 | 114.619 |
| 1593 | 115.587 |
| 1594 | 114.927 |
| 1595 | 115.682 |
| 1596 | 114.566 |
| 1597 | 115.226 |
| 1598 | 114.698 |
| 1599 | 113.592 |
| 1600 | 111.579 |
| 1601 | 111.052 |
| 1602 | 112.472 |
| 1603 | 110.943 |
| 1604 | 109.177 |
| 1605 | 107.514 |
| 1606 | 108.902 |
| 1607 | 109.993 |
| 1608 | 108.8 |
| 1609 | 107.577 |
| 1610 | 106.504 |
| 1611 | 106.047 |
| 1612 | 104.432 |
| 1613 | 106.245 |
| 1614 | 106.022 |
| 1615 | 104.991 |
| 1616 | 106.956 |
| 1617 | 106.09 |
| 1618 | 105.21 |
| 1619 | 105.45 |
| 1620 | 105.77 |
| 1621 | 107.551 |
| 1622 | 108.691 |
| 1623 | 107.533 |
| 1624 | 106.702 |
| 1625 | 105.599 |
| 1626 | 103.743 |
| 1627 | 104.748 |
| 1628 | 104.382 |
| 1629 | 103.353 |
| 1630 | 103.336 |
| 1631 | 103.775 |
| 1632 | 103.633 |
| 1633 | 102.626 |
| 1634 | 101.503 |
| 1635 | 102.738 |
| 1636 | 101.205 |
| 1637 | 99.975 |
| 1638 | 98.925 |
| 1639 | 97.916 |
| 1640 | 97.856 |
| 1641 | 98.056 |
| 1642 | 96.281 |
| 1643 | 94.784 |
| 1644 | 95.994 |
| 1645 | 97.882 |
| 1646 | 97.071 |
| 1647 | 95.437 |
| 1648 | 96.826 |
| 1649 | 98.452 |
| 1650 | 98.995 |
| 1651 | 99.665 |
| 1652 | 98.16 |
| 1653 | 96.711 |
| 1654 | 97.697 |
| 1655 | 96.328 |
| 1656 | 97.33 |
| 1657 | 95.909 |
| 1658 | 94.018 |
| 1659 | 94.734 |
| 1660 | 94.708 |
| 1661 | 92.929 |
| 1662 | 92.578 |
| 1663 | 93.42 |
| 1664 | 93.672 |
| 1665 | 92.156 |
| 1666 | 92.414 |
| 1667 | 91.851 |
| 1668 | 92.546 |
| 1669 | 92.448 |
| 1670 | 92.495 |
| 1671 | 94.133 |
| 1672 | 94.303 |
| 1673 | 93.02 |
| 1674 | 93.127 |
| 1675 | 93.094 |
| 1676 | 92.445 |
| 1677 | 93.701 |
| 1678 | 94.647 |
| 1679 | 94.975 |
| 1680 | 94.621 |
| 1681 | 96.51 |
| 1682 | 97.547 |
| 1683 | 98.999 |
| 1684 | 100.291 |
| 1685 | 99.986 |
| 1686 | 99.101 |
| 1687 | 99.415 |
| 1688 | 99.966 |
| 1689 | 101.258 |
| 1690 | 99.975 |
| 1691 | 98.076 |
| 1692 | 99.207 |
| 1693 | 97.569 |
| 1694 | 98.5 |
| 1695 | 99.55 |
| 1696 | 100.932 |
| 1697 | 102.894 |
| 1698 | 101.946 |
| 1699 | 102.072 |
| 1700 | 102.768 |
| 1701 | 102.339 |
| 1702 | 103.473 |
| 1703 | 103.074 |
| 1704 | 104.945 |
| 1705 | 105.512 |
| 1706 | 106.188 |
| 1707 | 108.077 |
| 1708 | 109.545 |
| 1709 | 110.238 |
| 1710 | 110.25 |
| 1711 | 111.056 |
| 1712 | 109.883 |
| 1713 | 109.933 |
| 1714 | 109.638 |
| 1715 | 109.426 |
| 1716 | 109.861 |
| 1717 | 110.426 |
| 1718 | 108.578 |
| 1719 | 109.801 |
| 1720 | 108.821 |
| 1721 | 107.932 |
| 1722 | 109.235 |
| 1723 | 107.437 |
| 1724 | 107.106 |
| 1725 | 106.166 |
| 1726 | 105.91 |
| 1727 | 104.208 |
| 1728 | 106.055 |
| 1729 | 106.224 |
| 1730 | 107.008 |
| 1731 | 106.236 |
| 1732 | 107.414 |
| 1733 | 107.212 |
| 1734 | 106.863 |
| 1735 | 105.328 |
| 1736 | 104.188 |
| 1737 | 104.905 |
| 1738 | 103.666 |
| 1739 | 103.56 |
| 1740 | 102.043 |
| 1741 | 102.547 |
| 1742 | 103.514 |
| 1743 | 104.467 |
| 1744 | 104.337 |
| 1745 | 104.446 |
| 1746 | 102.493 |
| 1747 | 104.263 |
| 1748 | 105.466 |
| 1749 | 105.383 |
| 1750 | 105.677 |
| 1751 | 104.142 |
| 1752 | 104.192 |
| 1753 | 105.626 |
| 1754 | 104.415 |
| 1755 | 103.933 |
| 1756 | 103.116 |
| 1757 | 103.57 |
| 1758 | 104.533 |
| 1759 | 106.483 |
| 1760 | 105.851 |
| 1761 | 106.476 |
| 1762 | 108.025 |
| 1763 | 106.434 |
| 1764 | 105.794 |
| 1765 | 104.334 |
| 1766 | 102.454 |
| 1767 | 103.74 |
| 1768 | 105.543 |
| 1769 | 105.653 |
| 1770 | 105.995 |
| 1771 | 105.761 |
| 1772 | 107.069 |
| 1773 | 106.751 |
| 1774 | 104.804 |
| 1775 | 102.912 |
| 1776 | 103.505 |
| 1777 | 104.363 |
| 1778 | 104.417 |
| 1779 | 106.102 |
| 1780 | 104.543 |
| 1781 | 103.233 |
| 1782 | 101.399 |
| 1783 | 100.207 |
| 1784 | 100.405 |
| 1785 | 100.044 |
| 1786 | 99.408 |
| 1787 | 97.884 |
| 1788 | 98.919 |
| 1789 | 99.243 |
| 1790 | 97.846 |
| 1791 | 97.057 |
| 1792 | 95.291 |
| 1793 | 96.653 |
| 1794 | 95.478 |
| 1795 | 94.705 |
| 1796 | 93.929 |
| 1797 | 94.533 |
| 1798 | 93.819 |
| 1799 | 95.795 |
| 1800 | 96.512 |
| 1801 | 98.217 |
| 1802 | 97.802 |
| 1803 | 97.058 |
| 1804 | 98.312 |
| 1805 | 99.203 |
| 1806 | 99.043 |
| 1807 | 99.054 |
| 1808 | 100.335 |
| 1809 | 100.463 |
| 1810 | 100.11 |
| 1811 | 101.298 |
| 1812 | 100.78 |
| 1813 | 101.299 |
| 1814 | 100.156 |
| 1815 | 98.315 |
| 1816 | 97.046 |
| 1817 | 97.2 |
| 1818 | 97.753 |
| 1819 | 95.962 |
| 1820 | 96.972 |
| 1821 | 98.99 |
| 1822 | 98.517 |
| 1823 | 96.941 |
| 1824 | 96.384 |
| 1825 | 97.869 |
| 1826 | 96.119 |
| 1827 | 97.885 |
| 1828 | 99.441 |
| 1829 | 99.162 |
| 1830 | 97.854 |
| 1831 | 98.675 |
| 1832 | 98.093 |
| 1833 | 97.15 |
| 1834 | 99.044 |
| 1835 | 98.974 |
| 1836 | 97.74 |
| 1837 | 98.762 |
| 1838 | 100.429 |
| 1839 | 98.553 |
| 1840 | 98.744 |
| 1841 | 98.877 |
| 1842 | 99.313 |
| 1843 | 99.13 |
| 1844 | 97.541 |
| 1845 | 97.708 |
| 1846 | 97.888 |
| 1847 | 96.114 |
| 1848 | 94.682 |
| 1849 | 94.123 |
| 1850 | 92.928 |
| 1851 | 94.619 |
| 1852 | 96.206 |
| 1853 | 95.356 |
| 1854 | 95.118 |
| 1855 | 95.191 |
| 1856 | 96.483 |
| 1857 | 97.866 |
| 1858 | 96.643 |
| 1859 | 98.174 |
| 1860 | 97.769 |
| 1861 | 97.059 |
| 1862 | 96.096 |
| 1863 | 97.027 |
| 1864 | 98.225 |
| 1865 | 96.86 |
| 1866 | 97.071 |
| 1867 | 96.377 |
| 1868 | 96.656 |
| 1869 | 97.486 |
| 1870 | 99.024 |
| 1871 | 97.643 |
| 1872 | 96.413 |
| 1873 | 97.666 |
| 1874 | 96.943 |
| 1875 | 95.826 |
| 1876 | 95.745 |
| 1877 | 96.931 |
| 1878 | 97.16 |
| 1879 | 97.402 |
| 1880 | 98.77 |
| 1881 | 99.586 |
| 1882 | 99.969 |
| 1883 | 99.952 |
| 1884 | 100.94 |
| 1885 | 99.492 |
| 1886 | 100.63 |
| 1887 | 101.337 |
| 1888 | 101.751 |
| 1889 | 100.382 |
| 1890 | 101.561 |
| 1891 | 101.907 |
| 1892 | 101.558 |
| 1893 | 101.205 |
| 1894 | 100.434 |
| 1895 | 102.266 |
| 1896 | 101.491 |
| 1897 | 99.614 |
| 1898 | 99.766 |
| 1899 | 100.8 |
| 1900 | 99.874 |
| 1901 | 98.063 |
| 1902 | 98.739 |
| 1903 | 97.521 |
| 1904 | 96.854 |
| 1905 | 94.917 |
| 1906 | 93.565 |
| 1907 | 92.74 |
| 1908 | 91.135 |
| 1909 | 92.17 |
| 1910 | 93.46 |
| 1911 | 93.504 |
| 1912 | 92.842 |
| 1913 | 94.816 |
| 1914 | 95.551 |
| 1915 | 95.741 |
| 1916 | 96.06 |
| 1917 | 94.711 |
| 1918 | 92.928 |
| 1919 | 94.819 |
| 1920 | 93.065 |
| 1921 | 92.636 |
| 1922 | 93.499 |
| 1923 | 92.5 |
| 1924 | 94.233 |
| 1925 | 95.156 |
| 1926 | 96.091 |
| 1927 | 94.606 |
| 1928 | 94.883 |
| 1929 | 96.626 |
| 1930 | 97.192 |
| 1931 | 98.292 |
| 1932 | 99.115 |
| 1933 | 97.804 |
| 1934 | 98.702 |
| 1935 | 97.022 |
| 1936 | 96.856 |
| 1937 | 97.967 |
| 1938 | 96.251 |
| 1939 | 94.958 |
| 1940 | 95.748 |
| 1941 | 96.246 |
| 1942 | 97.146 |
| 1943 | 97.351 |
| 1944 | 97.251 |
| 1945 | 99.165 |
| 1946 | 99.417 |
| 1947 | 101.155 |
| 1948 | 102.541 |
| 1949 | 100.596 |
| 1950 | 101.193 |
| 1951 | 100.423 |
| 1952 | 101.009 |
| 1953 | 101.304 |
| 1954 | 103.291 |
| 1955 | 101.561 |
| 1956 | 101.665 |
| 1957 | 103.182 |
| 1958 | 103.744 |
| 1959 | 105.413 |
| 1960 | 104.056 |
| 1961 | 105.903 |
| 1962 | 107.812 |
| 1963 | 106.581 |
| 1964 | 106.674 |
| 1965 | 105.407 |
| 1966 | 103.808 |
| 1967 | 102.49 |
| 1968 | 102.98 |
| 1969 | 102.324 |
| 1970 | 102.356 |
| 1971 | 104.04 |
| 1972 | 104.537 |
| 1973 | 104.809 |
| 1974 | 103.268 |
| 1975 | 102.772 |
| 1976 | 104.662 |
| 1977 | 104.851 |
| 1978 | 105.892 |
| 1979 | 106.866 |
| 1980 | 108.806 |
| 1981 | 109.607 |
| 1982 | 109.018 |
| 1983 | 108.796 |
| 1984 | 108.877 |
| 1985 | 108.153 |
| 1986 | 107.381 |
| 1987 | 108.466 |
| 1988 | 108.348 |
| 1989 | 107.318 |
| 1990 | 109.156 |
| 1991 | 108.774 |
| 1992 | 109.665 |
| 1993 | 109.475 |
| 1994 | 108.11 |
| 1995 | 108.067 |
| 1996 | 107.193 |
| 1997 | 106.369 |
| 1998 | 104.82 |
| 1999 | 103.211 |
| 2000 | 102.116 |
| 2001 | 101.717 |
| 2002 | 100.521 |
| 2003 | 99.703 |
| 2004 | 97.853 |
| 2005 | 98.366 |
| 2006 | 98.066 |
| 2007 | 97.152 |
| 2008 | 98.141 |
| 2009 | 98.384 |
| 2010 | 99.939 |
| 2011 | 98.671 |
| 2012 | 97.976 |
| 2013 | 99.593 |
| 2014 | 98.28 |
| 2015 | 99.87 |
| 2016 | 98.902 |
| 2017 | 100.771 |
| 2018 | 100.149 |
| 2019 | 100.137 |
| 2020 | 101.505 |
| 2021 | 101.803 |
| 2022 | 103.775 |
| 2023 | 104.705 |
| 2024 | 102.795 |
| 2025 | 101.272 |
| 2026 | 101.65 |
| 2027 | 103.274 |
| 2028 | 102.611 |
| 2029 | 101.442 |
| 2030 | 102.48 |
| 2031 | 101.594 |
| 2032 | 99.781 |
| 2033 | 100.174 |
| 2034 | 99.269 |
| 2035 | 97.635 |
| 2036 | 95.964 |
| 2037 | 95.282 |
| 2038 | 94.157 |
| 2039 | 92.333 |
| 2040 | 90.983 |
| 2041 | 90.433 |
| 2042 | 88.932 |
| 2043 | 90.143 |
| 2044 | 89.921 |
| 2045 | 89.487 |
| 2046 | 91.383 |
| 2047 | 90.797 |
| 2048 | 89.049 |
| 2049 | 87.873 |
| 2050 | 88.34 |
| 2051 | 87.735 |
| 2052 | 87.574 |
| 2053 | 86.866 |
| 2054 | 85.373 |
| 2055 | 85.2 |
| 2056 | 86.4 |
| 2057 | 85.011 |
| 2058 | 86.827 |
| 2059 | 88.247 |
| 2060 | 87.741 |
| 2061 | 87.811 |
| 2062 | 89.387 |
| 2063 | 90.263 |
| 2064 | 88.828 |
| 2065 | 89.72 |
| 2066 | 90.968 |
| 2067 | 92.55 |
| 2068 | 91.191 |
| 2069 | 91.315 |
| 2070 | 92.049 |
| 2071 | 92.999 |
| 2072 | 92.742 |
| 2073 | 91.747 |
| 2074 | 91.773 |
| 2075 | 91.666 |
| 2076 | 92.251 |
| 2077 | 93.809 |
| 2078 | 94.995 |
| 2079 | 96.856 |
| 2080 | 98.481 |
| 2081 | 97.578 |
| 2082 | 99.285 |
| 2083 | 97.856 |
| 2084 | 98.927 |
| 2085 | 98.852 |
| 2086 | 100.296 |
| 2087 | 98.974 |
| 2088 | 100.61 |
| 2089 | 100.31 |
| 2090 | 98.676 |
| 2091 | 97.128 |
| 2092 | 96.554 |
| 2093 | 97.915 |
| 2094 | 98.98 |
| 2095 | 97.909 |
| 2096 | 99.742 |
| 2097 | 101.539 |
| 2098 | 102.106 |
| 2099 | 103.979 |
| 2100 | 104.771 |
| 2101 | 106.058 |
| 2102 | 105.092 |
| 2103 | 104.679 |
| 2104 | 106.002 |
| 2105 | 107.043 |
| 2106 | 107.638 |
| 2107 | 109.247 |
| 2108 | 107.323 |
| 2109 | 108.353 |
| 2110 | 109.045 |
| 2111 | 110.501 |
| 2112 | 109.783 |
| 2113 | 109.971 |
| 2114 | 109.203 |
| 2115 | 107.793 |
| 2116 | 106.344 |
| 2117 | 105.54 |
| 2118 | 106.715 |
| 2119 | 105.297 |
| 2120 | 105.364 |
| 2121 | 107.301 |
| 2122 | 106.61 |
| 2123 | 105.942 |
| 2124 | 104.851 |
| 2125 | 103.178 |
| 2126 | 101.477 |
| 2127 | 100.136 |
| 2128 | 100.468 |
| 2129 | 101.666 |
| 2130 | 101.446 |
| 2131 | 103.348 |
| 2132 | 103.446 |
| 2133 | 105.446 |
| 2134 | 104.218 |
| 2135 | 105.124 |
| 2136 | 103.571 |
| 2137 | 105.406 |
| 2138 | 104.703 |
| 2139 | 105.146 |
| 2140 | 104.054 |
| 2141 | 102.084 |
| 2142 | 102.217 |
| 2143 | 101.534 |
| 2144 | 103.111 |
| 2145 | 103.198 |
| 2146 | 103.965 |
| 2147 | 104.041 |
| 2148 | 103.744 |
| 2149 | 105.162 |
| 2150 | 105.043 |
| 2151 | 105.782 |
| 2152 | 104.704 |
| 2153 | 106.523 |
| 2154 | 108.427 |
| 2155 | 108.521 |
| 2156 | 107.257 |
| 2157 | 106.606 |
| 2158 | 108.135 |
| 2159 | 108.075 |
| 2160 | 109.527 |
| 2161 | 109.927 |
| 2162 | 108.655 |
| 2163 | 107.481 |
| 2164 | 106.627 |
| 2165 | 105.935 |
| 2166 | 106.831 |
| 2167 | 108.269 |
| 2168 | 110.18 |
| 2169 | 108.403 |
| 2170 | 108.085 |
| 2171 | 109.832 |
| 2172 | 110.531 |
| 2173 | 111.241 |
| 2174 | 110.579 |
| 2175 | 111.162 |
| 2176 | 112.738 |
| 2177 | 111.726 |
| 2178 | 113.544 |
| 2179 | 114.943 |
| 2180 | 113.974 |
| 2181 | 113.221 |
| 2182 | 112.298 |
| 2183 | 110.54 |
| 2184 | 109.757 |
| 2185 | 110.985 |
| 2186 | 109.553 |
| 2187 | 108.73 |
| 2188 | 108.199 |
| 2189 | 109.144 |
| 2190 | 110.46 |
| 2191 | 109.042 |
| 2192 | 108.113 |
| 2193 | 109.139 |
| 2194 | 107.732 |
| 2195 | 106.524 |
| 2196 | 108.472 |
| 2197 | 108.182 |
| 2198 | 107.568 |
| 2199 | 107.645 |
| 2200 | 106.183 |
| 2201 | 105.354 |
| 2202 | 105.894 |
| 2203 | 105.862 |
| 2204 | 104.765 |
| 2205 | 102.912 |
| 2206 | 103.646 |
| 2207 | 104.32 |
| 2208 | 106.319 |
| 2209 | 106.257 |
| 2210 | 106.922 |
| 2211 | 107.683 |
| 2212 | 108.259 |
| 2213 | 109.998 |
| 2214 | 110.835 |
| 2215 | 111.45 |
| 2216 | 110.541 |
| 2217 | 111.318 |
| 2218 | 109.783 |
| 2219 | 109.121 |
| 2220 | 109.536 |
| 2221 | 110.022 |
| 2222 | 109.758 |
| 2223 | 109.246 |
| 2224 | 109.235 |
| 2225 | 110.335 |
| 2226 | 109.926 |
| 2227 | 110.518 |
| 2228 | 108.736 |
| 2229 | 110.299 |
| 2230 | 111.023 |
| 2231 | 112.423 |
| 2232 | 112.809 |
| 2233 | 111.186 |
| 2234 | 109.946 |
| 2235 | 111.543 |
| 2236 | 110.518 |
| 2237 | 108.665 |
| 2238 | 107.418 |
| 2239 | 108.36 |
| 2240 | 106.426 |
| 2241 | 107.5 |
| 2242 | 108.557 |
| 2243 | 108.013 |
| 2244 | 107.418 |
| 2245 | 106.174 |
| 2246 | 106.886 |
| 2247 | 105.712 |
| 2248 | 104.913 |
| 2249 | 103.297 |
| 2250 | 101.389 |
| 2251 | 101.817 |
| 2252 | 103.218 |
| 2253 | 103.125 |
| 2254 | 103.117 |
| 2255 | 103.69 |
| 2256 | 104.521 |
| 2257 | 105.171 |
| 2258 | 103.246 |
| 2259 | 103.542 |
| 2260 | 104.179 |
| 2261 | 104.37 |
| 2262 | 104.948 |
| 2263 | 106.872 |
| 2264 | 106.336 |
| 2265 | 108.255 |
| 2266 | 110.111 |
| 2267 | 110.376 |
| 2268 | 110.206 |
| 2269 | 111.107 |
| 2270 | 109.633 |
| 2271 | 107.696 |
| 2272 | 105.701 |
| 2273 | 107.01 |
| 2274 | 106.34 |
| 2275 | 107.189 |
| 2276 | 106.476 |
| 2277 | 107.448 |
| 2278 | 108.895 |
| 2279 | 108.512 |
| 2280 | 109.148 |
| 2281 | 108.892 |
| 2282 | 109.933 |
| 2283 | 111.618 |
| 2284 | 110.809 |
| 2285 | 111.672 |
| 2286 | 109.924 |
| 2287 | 110.256 |
| 2288 | 111.313 |
| 2289 | 112.886 |
| 2290 | 113.095 |
| 2291 | 113.515 |
| 2292 | 112.956 |
| 2293 | 113.044 |
| 2294 | 112.363 |
| 2295 | 111.079 |
| 2296 | 112.448 |
| 2297 | 112.915 |
| 2298 | 111.066 |
| 2299 | 109.196 |
| 2300 | 107.599 |
| 2301 | 108.381 |
| 2302 | 110.216 |
| 2303 | 108.876 |
| 2304 | 109.693 |
| 2305 | 111.698 |
| 2306 | 110.393 |
| 2307 | 111.26 |
| 2308 | 110.806 |
| 2309 | 108.986 |
| 2310 | 108.82 |
| 2311 | 107.62 |
| 2312 | 105.625 |
| 2313 | 106.285 |
| 2314 | 106.521 |
| 2315 | 106.739 |
| 2316 | 108.403 |
| 2317 | 107.699 |
| 2318 | 107.33 |
| 2319 | 105.525 |
| 2320 | 105.381 |
| 2321 | 104.869 |
| 2322 | 103.75 |
| 2323 | 104.417 |
| 2324 | 103.683 |
| 2325 | 102.868 |
| 2326 | 104.327 |
| 2327 | 103.733 |
| 2328 | 105.066 |
| 2329 | 106.991 |
| 2330 | 107.797 |
| 2331 | 108.336 |
| 2332 | 109.033 |
| 2333 | 110.979 |
| 2334 | 110.73 |
| 2335 | 110.411 |
| 2336 | 109.642 |
| 2337 | 111.236 |
| 2338 | 113.103 |
| 2339 | 112.525 |
| 2340 | 112.99 |
| 2341 | 114.983 |
| 2342 | 115.852 |
| 2343 | 117.733 |
| 2344 | 119.282 |
| 2345 | 118.371 |
| 2346 | 118.223 |
| 2347 | 117.869 |
| 2348 | 117.92 |
| 2349 | 119.092 |
| 2350 | 118.854 |
| 2351 | 120.6 |
| 2352 | 120.68 |
| 2353 | 120.99 |
| 2354 | 119.833 |
| 2355 | 118.22 |
| 2356 | 117.187 |
| 2357 | 115.872 |
| 2358 | 116.492 |
| 2359 | 116.853 |
| 2360 | 117.41 |
| 2361 | 116.217 |
| 2362 | 115.162 |
| 2363 | 113.417 |
| 2364 | 114.564 |
| 2365 | 114.688 |
| 2366 | 113.089 |
| 2367 | 112.162 |
| 2368 | 110.735 |
| 2369 | 110.899 |
| 2370 | 112.258 |
| 2371 | 113.688 |
| 2372 | 114.454 |
| 2373 | 114.918 |
| 2374 | 114.284 |
| 2375 | 113.272 |
| 2376 | 115.198 |
| 2377 | 114.899 |
| 2378 | 113.316 |
| 2379 | 112.991 |
| 2380 | 112.756 |
| 2381 | 112.922 |
| 2382 | 111.172 |
| 2383 | 109.394 |
| 2384 | 108.45 |
| 2385 | 109.152 |
| 2386 | 108.813 |
| 2387 | 108.418 |
| 2388 | 107.817 |
| 2389 | 108.092 |
| 2390 | 107.123 |
| 2391 | 108.305 |
| 2392 | 108.025 |
| 2393 | 108.526 |
| 2394 | 107.69 |
| 2395 | 108.408 |
| 2396 | 109.808 |
| 2397 | 108.385 |
| 2398 | 106.608 |
| 2399 | 105.366 |
| 2400 | 106.951 |
| 2401 | 106.753 |
| 2402 | 105.286 |
| 2403 | 106.141 |
| 2404 | 106.223 |
| 2405 | 104.824 |
| 2406 | 106.555 |
| 2407 | 107.131 |
| 2408 | 108.998 |
| 2409 | 108.857 |
| 2410 | 108.339 |
| 2411 | 108.046 |
| 2412 | 108.483 |
| 2413 | 109.933 |
| 2414 | 108.017 |
| 2415 | 108.314 |
| 2416 | 106.605 |
| 2417 | 105.287 |
| 2418 | 107.091 |
| 2419 | 106.536 |
| 2420 | 104.952 |
| 2421 | 105.869 |
| 2422 | 107.371 |
| 2423 | 108.562 |
| 2424 | 109.837 |
| 2425 | 111.411 |
| 2426 | 111.871 |
| 2427 | 110.958 |
| 2428 | 111.448 |
| 2429 | 112.587 |
| 2430 | 111.717 |
| 2431 | 112.566 |
| 2432 | 110.944 |
| 2433 | 110.591 |
| 2434 | 111.899 |
| 2435 | 113.697 |
| 2436 | 114.972 |
| 2437 | 115.989 |
| 2438 | 116.311 |
| 2439 | 115.784 |
| 2440 | 113.991 |
| 2441 | 114.343 |
| 2442 | 113.541 |
| 2443 | 111.776 |
| 2444 | 110.006 |
| 2445 | 109.272 |
| 2446 | 109.89 |
| 2447 | 110.72 |
| 2448 | 109.716 |
| 2449 | 110.303 |
| 2450 | 111.392 |
| 2451 | 111.188 |
| 2452 | 109.252 |
| 2453 | 108.799 |
| 2454 | 109.709 |
| 2455 | 108.586 |
| 2456 | 110.084 |
| 2457 | 108.076 |
| 2458 | 107.923 |
| 2459 | 106.718 |
| 2460 | 105.625 |
| 2461 | 105.311 |
| 2462 | 104.838 |
| 2463 | 105.376 |
| 2464 | 103.41 |
| 2465 | 101.707 |
| 2466 | 102.981 |
| 2467 | 102.012 |
| 2468 | 103.969 |
| 2469 | 102.212 |
| 2470 | 102.991 |
| 2471 | 102.847 |
| 2472 | 104.78 |
| 2473 | 106.229 |
| 2474 | 107.475 |
| 2475 | 105.547 |
| 2476 | 105.381 |
| 2477 | 105.875 |
| 2478 | 107.797 |
| 2479 | 108.963 |
| 2480 | 107.643 |
| 2481 | 108.633 |
| 2482 | 109.205 |
| 2483 | 108.371 |
| 2484 | 109.331 |
| 2485 | 110.896 |
| 2486 | 111.351 |
| 2487 | 112.844 |
| 2488 | 113.111 |
| 2489 | 113.495 |
| 2490 | 115.149 |
| 2491 | 115.091 |
| 2492 | 116.526 |
| 2493 | 117.055 |
| 2494 | 117.898 |
| 2495 | 117.966 |
| 2496 | 118.367 |
| 2497 | 118.55 |
| 2498 | 117.488 |
| 2499 | 119.432 |
| 2500 | 121.42 |
| 2501 | 119.587 |
| 2502 | 119.52 |
| 2503 | 120.322 |
| 2504 | 120.409 |
| 2505 | 121.306 |
| 2506 | 121.509 |
| 2507 | 120.806 |
| 2508 | 120.601 |
| 2509 | 120.287 |
| 2510 | 121.16 |
| 2511 | 120.211 |
| 2512 | 121.513 |
| 2513 | 121.463 |
| 2514 | 119.646 |
| 2515 | 121.301 |
| 2516 | 120.417 |
| 2517 | 119.58 |
| 2518 | 120.574 |
| 2519 | 121.465 |
| 2520 | 119.735 |
| 2521 | 118.127 |
| 2522 | 119.335 |
| 2523 | 119.571 |
| 2524 | 118.514 |
| 2525 | 118.266 |
| 2526 | 119.789 |
| 2527 | 118.626 |
| 2528 | 117.714 |
| 2529 | 118.883 |
| 2530 | 118.944 |
| 2531 | 117.012 |
| 2532 | 116.824 |
| 2533 | 115.974 |
| 2534 | 115.523 |
| 2535 | 114.447 |
| 2536 | 113.229 |
| 2537 | 113.207 |
| 2538 | 112.807 |
| 2539 | 111.285 |
| 2540 | 109.416 |
| 2541 | 110.587 |
| 2542 | 111.84 |
| 2543 | 113.18 |
| 2544 | 112.251 |
| 2545 | 111.031 |
| 2546 | 112.219 |
| 2547 | 113.414 |
| 2548 | 115.04 |
| 2549 | 116.141 |
| 2550 | 117.143 |
| 2551 | 115.243 |
| 2552 | 113.283 |
| 2553 | 114.1 |
| 2554 | 112.744 |
| 2555 | 112.192 |
| 2556 | 111.59 |
| 2557 | 110.962 |
| 2558 | 110.412 |
| 2559 | 111.706 |
| 2560 | 110.015 |
| 2561 | 111.33 |
| 2562 | 111.845 |
| 2563 | 113.532 |
| 2564 | 113.257 |
| 2565 | 111.457 |
| 2566 | 111.351 |
| 2567 | 112.015 |
| 2568 | 112.801 |
| 2569 | 113.739 |
| 2570 | 113.831 |
| 2571 | 115.127 |
| 2572 | 117.083 |
| 2573 | 118.267 |
| 2574 | 116.838 |
| 2575 | 117.904 |
| 2576 | 119.816 |
| 2577 | 118.294 |
| 2578 | 117.447 |
| 2579 | 115.48 |
| 2580 | 116.786 |
| 2581 | 118.26 |
| 2582 | 116.6 |
| 2583 | 116.39 |
| 2584 | 115.981 |
| 2585 | 117.239 |
| 2586 | 116.054 |
| 2587 | 117.966 |
| 2588 | 118.372 |
| 2589 | 119.291 |
| 2590 | 119.224 |
| 2591 | 120.068 |
| 2592 | 121.064 |
| 2593 | 122.07 |
| 2594 | 123.703 |
| 2595 | 122.475 |
| 2596 | 120.88 |
| 2597 | 119.756 |
| 2598 | 120.059 |
| 2599 | 121.423 |
| 2600 | 121.921 |
| 2601 | 120.06 |
| 2602 | 120.819 |
| 2603 | 122.549 |
| 2604 | 124.255 |
| 2605 | 125.422 |
| 2606 | 124.709 |
| 2607 | 124.733 |
| 2608 | 124.404 |
| 2609 | 125.732 |
| 2610 | 127.342 |
| 2611 | 125.692 |
| 2612 | 127.231 |
| 2613 | 126.683 |
| 2614 | 125.901 |
| 2615 | 124.447 |
| 2616 | 124.161 |
| 2617 | 125.991 |
| 2618 | 126.849 |
| 2619 | 125.671 |
| 2620 | 125.922 |
| 2621 | 126.746 |
| 2622 | 124.887 |
| 2623 | 123.492 |
| 2624 | 123.133 |
| 2625 | 122.239 |
| 2626 | 120.372 |
| 2627 | 119.317 |
| 2628 | 120.86 |
| 2629 | 119.65 |
| 2630 | 119.611 |
| 2631 | 118.185 |
| 2632 | 117.05 |
| 2633 | 115.697 |
| 2634 | 115.784 |
| 2635 | 116.461 |
| 2636 | 115.752 |
| 2637 | 116.328 |
| 2638 | 115.944 |
| 2639 | 115.372 |
| 2640 | 116.443 |
| 2641 | 115.318 |
| 2642 | 113.442 |
| 2643 | 111.987 |
| 2644 | 110.741 |
| 2645 | 109.491 |
| 2646 | 110.312 |
| 2647 | 110.742 |
| 2648 | 112.107 |
| 2649 | 112.578 |
| 2650 | 111.655 |
| 2651 | 111.875 |
| 2652 | 110.52 |
| 2653 | 111.579 |
| 2654 | 113.35 |
| 2655 | 114.423 |
| 2656 | 114.073 |
| 2657 | 113.584 |
| 2658 | 114.873 |
| 2659 | 115.699 |
| 2660 | 114.751 |
| 2661 | 114.426 |
| 2662 | 113.316 |
| 2663 | 112.481 |
| 2664 | 113.148 |
| 2665 | 111.947 |
| 2666 | 111.449 |
| 2667 | 110.043 |
| 2668 | 108.618 |
| 2669 | 109.943 |
| 2670 | 111.156 |
| 2671 | 111.744 |
| 2672 | 113.727 |
| 2673 | 112.905 |
| 2674 | 114.702 |
| 2675 | 113.309 |
| 2676 | 114.264 |
| 2677 | 115.672 |
| 2678 | 115.947 |
| 2679 | 117.651 |
| 2680 | 116.965 |
| 2681 | 117.773 |
| 2682 | 118.955 |
| 2683 | 120.085 |
| 2684 | 121.485 |
| 2685 | 119.684 |
| 2686 | 121.473 |
| 2687 | 119.646 |
| 2688 | 120.218 |
| 2689 | 120.99 |
| 2690 | 119.142 |
| 2691 | 118.75 |
| 2692 | 117.682 |
| 2693 | 118.682 |
| 2694 | 118.716 |
| 2695 | 119.992 |
| 2696 | 121.552 |
| 2697 | 120.092 |
| 2698 | 121.282 |
| 2699 | 122.618 |
| 2700 | 123.068 |
| 2701 | 121.37 |
| 2702 | 122.777 |
| 2703 | 122.178 |
| 2704 | 124.131 |
| 2705 | 125.316 |
| 2706 | 126.937 |
| 2707 | 128.332 |
| 2708 | 127.329 |
| 2709 | 127.417 |
| 2710 | 126.961 |
| 2711 | 127.163 |
| 2712 | 128.656 |
| 2713 | 129.836 |
| 2714 | 128.438 |
| 2715 | 129.177 |
| 2716 | 131.146 |
| 2717 | 132.356 |
| 2718 | 133.171 |
| 2719 | 133.994 |
| 2720 | 134.769 |
| 2721 | 135.826 |
| 2722 | 135.418 |
| 2723 | 137.093 |
| 2724 | 135.166 |
| 2725 | 136.335 |
| 2726 | 134.813 |
| 2727 | 134.947 |
| 2728 | 134.064 |
| 2729 | 133.753 |
| 2730 | 132.988 |
| 2731 | 131.567 |
| 2732 | 132.603 |
| 2733 | 132.986 |
| 2734 | 134.425 |
| 2735 | 132.985 |
| 2736 | 134.72 |
| 2737 | 136.126 |
| 2738 | 134.612 |
| 2739 | 133.378 |
| 2740 | 133.248 |
| 2741 | 134.467 |
| 2742 | 132.663 |
| 2743 | 132.497 |
| 2744 | 133.057 |
| 2745 | 133.868 |
| 2746 | 133.94 |
| 2747 | 134.83 |
| 2748 | 135.287 |
| 2749 | 135.725 |
| 2750 | 137.673 |
| 2751 | 135.937 |
| 2752 | 135.428 |
| 2753 | 136.452 |
| 2754 | 138.198 |
| 2755 | 136.944 |
| 2756 | 136.068 |
| 2757 | 134.439 |
| 2758 | 134.623 |
| 2759 | 134.555 |
| 2760 | 135.657 |
| 2761 | 136.406 |
| 2762 | 137.117 |
| 2763 | 138.071 |
| 2764 | 138.393 |
| 2765 | 139.64 |
| 2766 | 140.168 |
| 2767 | 140.331 |
| 2768 | 138.964 |
| 2769 | 140.27 |
| 2770 | 138.559 |
| 2771 | 136.88 |
| 2772 | 137.202 |
| 2773 | 135.958 |
| 2774 | 134.289 |
| 2775 | 133.901 |
| 2776 | 132.321 |
| 2777 | 131.308 |
| 2778 | 130.206 |
| 2779 | 132.152 |
| 2780 | 131.92 |
| 2781 | 132.024 |
| 2782 | 133.287 |
| 2783 | 132.833 |
| 2784 | 134.324 |
| 2785 | 136.003 |
| 2786 | 134.33 |
| 2787 | 134.231 |
| 2788 | 133.361 |
| 2789 | 134.835 |
| 2790 | 133.454 |
| 2791 | 133.985 |
| 2792 | 135.996 |
| 2793 | 135.669 |
| 2794 | 137.362 |
| 2795 | 138.431 |
| 2796 | 138.564 |
| 2797 | 137.882 |
| 2798 | 139.317 |
| 2799 | 141.081 |
| 2800 | 140.875 |
| 2801 | 142.73 |
| 2802 | 144.154 |
| 2803 | 145.683 |
| 2804 | 144.276 |
| 2805 | 145.28 |
| 2806 | 143.628 |
| 2807 | 143.79 |
| 2808 | 145.243 |
| 2809 | 143.555 |
| 2810 | 142.257 |
| 2811 | 142.239 |
| 2812 | 140.902 |
| 2813 | 142.497 |
| 2814 | 144.378 |
| 2815 | 144.267 |
| 2816 | 143.101 |
| 2817 | 142.058 |
| 2818 | 140.277 |
| 2819 | 139.118 |
| 2820 | 140.133 |
| 2821 | 141.218 |
| 2822 | 141.112 |
| 2823 | 141.277 |
| 2824 | 141.444 |
| 2825 | 142.245 |
| 2826 | 142.407 |
| 2827 | 144.035 |
| 2828 | 144.591 |
| 2829 | 144.845 |
| 2830 | 146.253 |
| 2831 | 144.869 |
| 2832 | 145.93 |
| 2833 | 146.062 |
| 2834 | 148.035 |
| 2835 | 147.939 |
| 2836 | 149.239 |
| 2837 | 147.795 |
| 2838 | 146.425 |
| 2839 | 147.904 |
| 2840 | 147.67 |
| 2841 | 146.372 |
| 2842 | 145.483 |
| 2843 | 143.943 |
| 2844 | 143.879 |
| 2845 | 143.522 |
| 2846 | 143.984 |
| 2847 | 144.185 |
| 2848 | 143.903 |
| 2849 | 145.492 |
| 2850 | 145.244 |
| 2851 | 143.674 |
| 2852 | 142.535 |
| 2853 | 142.035 |
| 2854 | 141.032 |
| 2855 | 140.228 |
| 2856 | 141.975 |
| 2857 | 140.325 |
| 2858 | 141.401 |
| 2859 | 139.81 |
| 2860 | 139.489 |
| 2861 | 139.428 |
| 2862 | 139.586 |
| 2863 | 140.355 |
| 2864 | 141.424 |
| 2865 | 139.753 |
| 2866 | 138.881 |
| 2867 | 139.521 |
| 2868 | 139.72 |
| 2869 | 138.779 |
| 2870 | 139.516 |
| 2871 | 138.125 |
| 2872 | 137.655 |
| 2873 | 137.343 |
| 2874 | 138.33 |
| 2875 | 138.653 |
| 2876 | 140.225 |
| 2877 | 142.091 |
| 2878 | 143.227 |
| 2879 | 142.198 |
| 2880 | 143.314 |
| 2881 | 142.864 |
| 2882 | 142.248 |
| 2883 | 142.195 |
| 2884 | 141.435 |
| 2885 | 143.259 |
| 2886 | 142.91 |
| 2887 | 141.127 |
| 2888 | 141.613 |
| 2889 | 143.561 |
| 2890 | 143.849 |
| 2891 | 142.414 |
| 2892 | 140.99 |
| 2893 | 142.072 |
| 2894 | 142.54 |
| 2895 | 144.117 |
| 2896 | 143.999 |
| 2897 | 145.966 |
| 2898 | 146.212 |
| 2899 | 145.041 |
| 2900 | 144.012 |
| 2901 | 145.718 |
| 2902 | 144.021 |
| 2903 | 144.393 |
| 2904 | 145.724 |
| 2905 | 145.041 |
| 2906 | 143.109 |
| 2907 | 143.865 |
| 2908 | 144.847 |
| 2909 | 143.1 |
| 2910 | 143.702 |
| 2911 | 144.912 |
| 2912 | 145.694 |
| 2913 | 145.285 |
| 2914 | 146.511 |
| 2915 | 145.714 |
| 2916 | 146.854 |
| 2917 | 147.801 |
| 2918 | 148.934 |
| 2919 | 150.338 |
| 2920 | 152.291 |
| 2921 | 153.727 |
| 2922 | 152.904 |
| 2923 | 154.752 |
| 2924 | 156.403 |
| 2925 | 157.04 |
| 2926 | 158.079 |
| 2927 | 159.703 |
| 2928 | 160.812 |
| 2929 | 160.645 |
| 2930 | 160.191 |
| 2931 | 158.397 |
| 2932 | 159.08 |
| 2933 | 157.788 |
| 2934 | 157.534 |
| 2935 | 158.074 |
| 2936 | 158.023 |
| 2937 | 159.672 |
| 2938 | 161.427 |
| 2939 | 162.505 |
| 2940 | 164.351 |
| 2941 | 162.452 |
| 2942 | 160.997 |
| 2943 | 160.505 |
| 2944 | 158.741 |
| 2945 | 157.332 |
| 2946 | 157.768 |
| 2947 | 159.34 |
| 2948 | 158.133 |
| 2949 | 158.574 |
| 2950 | 158.915 |
| 2951 | 157.019 |
| 2952 | 157.259 |
| 2953 | 155.789 |
| 2954 | 156.88 |
| 2955 | 158.761 |
| 2956 | 157.953 |
| 2957 | 158.407 |
| 2958 | 159.35 |
| 2959 | 159.315 |
| 2960 | 161.177 |
| 2961 | 161.085 |
| 2962 | 161.193 |
| 2963 | 162.627 |
| 2964 | 162.836 |
| 2965 | 163.77 |
| 2966 | 164.438 |
| 2967 | 165.247 |
| 2968 | 165.688 |
| 2969 | 167.644 |
| 2970 | 166.976 |
| 2971 | 166.5 |
| 2972 | 166.311 |
| 2973 | 165.279 |
| 2974 | 163.613 |
| 2975 | 164.768 |
| 2976 | 166.364 |
| 2977 | 166.069 |
| 2978 | 167.601 |
| 2979 | 167.284 |
| 2980 | 167.723 |
| 2981 | 167.922 |
| 2982 | 169.381 |
| 2983 | 169.67 |
| 2984 | 170.651 |
| 2985 | 172.588 |
| 2986 | 171.732 |
| 2987 | 172.78 |
| 2988 | 173.269 |
| 2989 | 175.031 |
| 2990 | 174.222 |
| 2991 | 175.893 |
| 2992 | 177.478 |
| 2993 | 176.958 |
| 2994 | 175.173 |
| 2995 | 174.586 |
| 2996 | 176.147 |
| 2997 | 175.012 |
| 2998 | 176.613 |
| 2999 | 174.987 |
| 3000 | 174.263 |
| 3001 | 174.894 |
| 3002 | 173.353 |
| 3003 | 174.266 |
| 3004 | 175.286 |
| 3005 | 174.744 |
| 3006 | 173.853 |
| 3007 | 174.582 |
| 3008 | 175.65 |
| 3009 | 176.126 |
| 3010 | 176.994 |
| 3011 | 178.507 |
| 3012 | 179.173 |
| 3013 | 178.731 |
| 3014 | 180.013 |
| 3015 | 181.729 |
| 3016 | 180.707 |
| 3017 | 182.296 |
| 3018 | 181.32 |
| 3019 | 180.68 |
| 3020 | 179.93 |
| 3021 | 179.192 |
| 3022 | 179.077 |
| 3023 | 177.267 |
| 3024 | 177.412 |
| 3025 | 176.914 |
| 3026 | 176.506 |
| 3027 | 176.477 |
| 3028 | 177.071 |
| 3029 | 177.687 |
| 3030 | 178.158 |
| 3031 | 179.924 |
| 3032 | 180.836 |
| 3033 | 180.837 |
| 3034 | 181.208 |
| 3035 | 180.428 |
| 3036 | 181.998 |
| 3037 | 183.784 |
| 3038 | 185.317 |
| 3039 | 184.212 |
| 3040 | 182.348 |
| 3041 | 180.643 |
| 3042 | 181.466 |
| 3043 | 183.321 |
| 3044 | 184.581 |
| 3045 | 184.628 |
| 3046 | 186.327 |
| 3047 | 186.195 |
| 3048 | 185.128 |
| 3049 | 187.006 |
| 3050 | 186.44 |
| 3051 | 188.155 |
| 3052 | 186.332 |
| 3053 | 188.165 |
| 3054 | 188.636 |
| 3055 | 187.293 |
| 3056 | 185.419 |
| 3057 | 185.208 |
| 3058 | 186.477 |
| 3059 | 185.411 |
| 3060 | 183.766 |
| 3061 | 183.373 |
| 3062 | 184.532 |
| 3063 | 182.856 |
| 3064 | 182.989 |
| 3065 | 182.625 |
| 3066 | 182.374 |
| 3067 | 182.014 |
| 3068 | 180.173 |
| 3069 | 178.594 |
| 3070 | 177.782 |
| 3071 | 177.816 |
| 3072 | 179.15 |
| 3073 | 179.661 |
| 3074 | 179.434 |
| 3075 | 179.81 |
| 3076 | 180.292 |
| 3077 | 179.395 |
| 3078 | 179.501 |
| 3079 | 180.108 |
| 3080 | 180.391 |
| 3081 | 179.553 |
| 3082 | 180.83 |
| 3083 | 182.519 |
| 3084 | 181.385 |
| 3085 | 180.779 |
| 3086 | 182.06 |
| 3087 | 181.333 |
| 3088 | 181.133 |
| 3089 | 182.185 |
| 3090 | 181.381 |
| 3091 | 180.213 |
| 3092 | 178.786 |
| 3093 | 177.577 |
| 3094 | 177.463 |
| 3095 | 179.476 |
| 3096 | 180.195 |
| 3097 | 178.553 |
| 3098 | 180.042 |
| 3099 | 181.96 |
| 3100 | 180.369 |
| 3101 | 181.87 |
| 3102 | 182.452 |
| 3103 | 183.893 |
| 3104 | 184.594 |
| 3105 | 182.921 |
| 3106 | 180.909 |
| 3107 | 180.236 |
| 3108 | 180.836 |
| 3109 | 179.966 |
| 3110 | 178.603 |
| 3111 | 179.526 |
| 3112 | 180.139 |
| 3113 | 180.438 |
| 3114 | 180.665 |
| 3115 | 178.986 |
| 3116 | 179.501 |
| 3117 | 177.763 |
| 3118 | 178.748 |
| 3119 | 177.299 |
| 3120 | 178.155 |
| 3121 | 180.138 |
| 3122 | 181.282 |
| 3123 | 182.329 |
| 3124 | 181.184 |
| 3125 | 181.099 |
| 3126 | 182.008 |
| 3127 | 180.137 |
| 3128 | 181.228 |
| 3129 | 182.164 |
| 3130 | 183.003 |
| 3131 | 181.708 |
| 3132 | 179.792 |
| 3133 | 178.52 |
| 3134 | 177.344 |
| 3135 | 176.446 |
| 3136 | 176.655 |
| 3137 | 175.65 |
| 3138 | 176.559 |
| 3139 | 177.454 |
| 3140 | 179.391 |
| 3141 | 178.946 |
| 3142 | 177.284 |
| 3143 | 176.071 |
| 3144 | 174.763 |
| 3145 | 175.111 |
| 3146 | 175.268 |
| 3147 | 173.569 |
| 3148 | 171.871 |
| 3149 | 171.651 |
| 3150 | 170.552 |
| 3151 | 169.046 |
| 3152 | 169.597 |
| 3153 | 170.829 |
| 3154 | 172.074 |
| 3155 | 173.352 |
| 3156 | 174.855 |
| 3157 | 174.676 |
| 3158 | 175.687 |
| 3159 | 175.819 |
| 3160 | 174.806 |
| 3161 | 173.285 |
| 3162 | 173.206 |
| 3163 | 172.412 |
| 3164 | 173.362 |
| 3165 | 172.449 |
| 3166 | 171.543 |
| 3167 | 169.745 |
| 3168 | 168.575 |
| 3169 | 167.793 |
| 3170 | 168.076 |
| 3171 | 167.174 |
| 3172 | 168.296 |
| 3173 | 169.224 |
| 3174 | 170.688 |
| 3175 | 170.106 |
| 3176 | 170.962 |
| 3177 | 171.87 |
| 3178 | 170.765 |
| 3179 | 169.95 |
| 3180 | 168.247 |
| 3181 | 169.078 |
| 3182 | 170.93 |
| 3183 | 169.48 |
| 3184 | 170.928 |
| 3185 | 169.38 |
| 3186 | 167.756 |
| 3187 | 168.698 |
| 3188 | 168.653 |
| 3189 | 170.014 |
| 3190 | 171.978 |
| 3191 | 172.346 |
| 3192 | 171.344 |
| 3193 | 170.134 |
| 3194 | 168.535 |
| 3195 | 167.147 |
| 3196 | 168.208 |
| 3197 | 168.1 |
| 3198 | 168.69 |
| 3199 | 167.355 |
| 3200 | 167.358 |
| 3201 | 167.371 |
| 3202 | 166.645 |
| 3203 | 164.997 |
| 3204 | 163.115 |
| 3205 | 164.575 |
| 3206 | 164.357 |
| 3207 | 163.416 |
| 3208 | 163.926 |
| 3209 | 163.999 |
| 3210 | 165.74 |
| 3211 | 166.733 |
| 3212 | 166.293 |
| 3213 | 167.938 |
| 3214 | 167.01 |
| 3215 | 168.288 |
| 3216 | 167.102 |
| 3217 | 167.628 |
| 3218 | 167.427 |
| 3219 | 165.835 |
| 3220 | 166.886 |
| 3221 | 168.767 |
| 3222 | 169.527 |
| 3223 | 169.215 |
| 3224 | 170.595 |
| 3225 | 171.822 |
| 3226 | 170.569 |
| 3227 | 168.963 |
| 3228 | 167.089 |
| 3229 | 166.045 |
| 3230 | 165.476 |
| 3231 | 165.52 |
| 3232 | 164.961 |
| 3233 | 162.952 |
| 3234 | 164.107 |
| 3235 | 164.807 |
| 3236 | 163.984 |
| 3237 | 165.99 |
| 3238 | 166.17 |
| 3239 | 164.623 |
| 3240 | 164.804 |
| 3241 | 166.511 |
| 3242 | 164.786 |
| 3243 | 164.178 |
| 3244 | 164.654 |
| 3245 | 164.725 |
| 3246 | 165.414 |
| 3247 | 163.995 |
| 3248 | 162.371 |
| 3249 | 161.56 |
| 3250 | 161.745 |
| 3251 | 162.413 |
| 3252 | 164.233 |
| 3253 | 162.791 |
| 3254 | 162.26 |
| 3255 | 161.377 |
| 3256 | 161.767 |
| 3257 | 159.983 |
| 3258 | 158.087 |
| 3259 | 156.558 |
| 3260 | 154.882 |
| 3261 | 154.623 |
| 3262 | 155.709 |
| 3263 | 155.449 |
| 3264 | 155.524 |
| 3265 | 156.683 |
| 3266 | 155.966 |
| 3267 | 156.33 |
| 3268 | 156.302 |
| 3269 | 155.988 |
| 3270 | 156.84 |
| 3271 | 158.408 |
| 3272 | 158.22 |
| 3273 | 159.347 |
| 3274 | 159.729 |
| 3275 | 160.809 |
| 3276 | 160.494 |
| 3277 | 160.772 |
| 3278 | 162.179 |
| 3279 | 162.912 |
| 3280 | 161.759 |
| 3281 | 161.246 |
| 3282 | 160.849 |
| 3283 | 158.888 |
| 3284 | 159.253 |
| 3285 | 159.72 |
| 3286 | 161.094 |
| 3287 | 161.588 |
| 3288 | 161.318 |
| 3289 | 159.575 |
| 3290 | 157.866 |
| 3291 | 157.642 |
| 3292 | 155.937 |
| 3293 | 157.404 |
| 3294 | 156.806 |
| 3295 | 156.251 |
| 3296 | 158.058 |
| 3297 | 156.332 |
| 3298 | 158.277 |
| 3299 | 159.789 |
| 3300 | 159.977 |
| 3301 | 158.615 |
| 3302 | 160.302 |
| 3303 | 161.014 |
| 3304 | 161.305 |
| 3305 | 162.211 |
| 3306 | 160.213 |
| 3307 | 161.423 |
| 3308 | 161.468 |
| 3309 | 162.632 |
| 3310 | 162.2 |
| 3311 | 162.063 |
| 3312 | 160.567 |
| 3313 | 159.191 |
| 3314 | 159.939 |
| 3315 | 159.701 |
| 3316 | 160.247 |
| 3317 | 161 |
| 3318 | 160.668 |
| 3319 | 162.514 |
| 3320 | 163.43 |
| 3321 | 162.254 |
| 3322 | 162.584 |
| 3323 | 162.423 |
| 3324 | 162.143 |
| 3325 | 160.197 |
| 3326 | 160.642 |
| 3327 | 161.407 |
| 3328 | 160.19 |
| 3329 | 161.067 |
| 3330 | 160.463 |
| 3331 | 159.241 |
| 3332 | 159.571 |
| 3333 | 157.948 |
| 3334 | 156.026 |
| 3335 | 154.52 |
| 3336 | 155.357 |
| 3337 | 155.746 |
| 3338 | 157.126 |
| 3339 | 157.657 |
| 3340 | 159.253 |
| 3341 | 160.175 |
| 3342 | 160.513 |
| 3343 | 162.434 |
| 3344 | 162.608 |
| 3345 | 161.921 |
| 3346 | 162.888 |
| 3347 | 162.314 |
| 3348 | 163.496 |
| 3349 | 161.966 |
| 3350 | 163.521 |
| 3351 | 163.803 |
| 3352 | 165.352 |
| 3353 | 163.884 |
| 3354 | 164.989 |
| 3355 | 163.496 |
| 3356 | 163.327 |
| 3357 | 164.914 |
| 3358 | 166.263 |
| 3359 | 166.56 |
| 3360 | 168.266 |
| 3361 | 167.489 |
| 3362 | 168.301 |
| 3363 | 166.566 |
| 3364 | 165.376 |
| 3365 | 164.094 |
| 3366 | 163.831 |
| 3367 | 162.576 |
| 3368 | 162.154 |
| 3369 | 164.013 |
| 3370 | 162.493 |
| 3371 | 162.18 |
| 3372 | 162.134 |
| 3373 | 161.736 |
| 3374 | 161.471 |
| 3375 | 161.908 |
| 3376 | 160.722 |
| 3377 | 158.766 |
| 3378 | 158.562 |
| 3379 | 160.444 |
| 3380 | 160.871 |
| 3381 | 162.064 |
| 3382 | 163.087 |
| 3383 | 161.576 |
| 3384 | 159.819 |
| 3385 | 158.648 |
| 3386 | 160.577 |
| 3387 | 160.349 |
| 3388 | 161.207 |
| 3389 | 160.24 |
| 3390 | 161.65 |
| 3391 | 161.5 |
| 3392 | 163.309 |
| 3393 | 164.359 |
| 3394 | 164.02 |
| 3395 | 165.364 |
| 3396 | 167.027 |
| 3397 | 167.529 |
| 3398 | 168.734 |
| 3399 | 169.836 |
| 3400 | 168.282 |
| 3401 | 167.429 |
| 3402 | 167.076 |
| 3403 | 166.931 |
| 3404 | 166.868 |
| 3405 | 168.409 |
| 3406 | 168.529 |
| 3407 | 167.746 |
| 3408 | 168.044 |
| 3409 | 168.43 |
| 3410 | 166.428 |
| 3411 | 167.065 |
| 3412 | 165.714 |
| 3413 | 164.968 |
| 3414 | 166.815 |
| 3415 | 165.013 |
| 3416 | 164.061 |
| 3417 | 163.26 |
| 3418 | 164.982 |
| 3419 | 164.25 |
| 3420 | 164.892 |
| 3421 | 164.78 |
| 3422 | 164.403 |
| 3423 | 163.605 |
| 3424 | 163.322 |
| 3425 | 162.732 |
| 3426 | 163.902 |
| 3427 | 163.128 |
| 3428 | 164.052 |
| 3429 | 165.344 |
| 3430 | 164.017 |
| 3431 | 163.851 |
| 3432 | 165.167 |
| 3433 | 165.538 |
| 3434 | 166.193 |
| 3435 | 165.893 |
| 3436 | 165.124 |
| 3437 | 164.121 |
| 3438 | 164.491 |
| 3439 | 166.321 |
| 3440 | 166.245 |
| 3441 | 166.178 |
| 3442 | 166.496 |
| 3443 | 165.194 |
| 3444 | 166.479 |
| 3445 | 166.176 |
| 3446 | 165.524 |
| 3447 | 167.309 |
| 3448 | 168.69 |
| 3449 | 169.807 |
| 3450 | 168.057 |
| 3451 | 169.662 |
| 3452 | 167.874 |
| 3453 | 166.553 |
| 3454 | 166.579 |
| 3455 | 166.865 |
| 3456 | 167.624 |
| 3457 | 165.85 |
| 3458 | 166.281 |
| 3459 | 165.632 |
| 3460 | 167.489 |
| 3461 | 167.84 |
| 3462 | 169.743 |
| 3463 | 171.012 |
| 3464 | 171.134 |
| 3465 | 169.404 |
| 3466 | 167.778 |
| 3467 | 167.404 |
| 3468 | 168.81 |
| 3469 | 170.271 |
| 3470 | 170.093 |
| 3471 | 171.354 |
| 3472 | 171.987 |
| 3473 | 172.47 |
| 3474 | 172.748 |
| 3475 | 174.629 |
| 3476 | 174.523 |
| 3477 | 175.189 |
| 3478 | 176.28 |
| 3479 | 176.936 |
| 3480 | 178.55 |
| 3481 | 179.781 |
| 3482 | 179.589 |
| 3483 | 180.807 |
| 3484 | 180.009 |
| 3485 | 181.174 |
| 3486 | 180.977 |
| 3487 | 180.879 |
| 3488 | 179.292 |
| 3489 | 179.85 |
| 3490 | 180.083 |
| 3491 | 179.145 |
| 3492 | 180.003 |
| 3493 | 181.072 |
| 3494 | 179.821 |
| 3495 | 178.979 |
| 3496 | 180.762 |
| 3497 | 181.602 |
| 3498 | 181.857 |
| 3499 | 181.857 |
| 3500 | 182.647 |
| 3501 | 182.575 |
| 3502 | 183.916 |
| 3503 | 183.316 |
| 3504 | 182.255 |
| 3505 | 180.571 |
| 3506 | 182.184 |
| 3507 | 180.767 |
| 3508 | 179.32 |
| 3509 | 178.297 |
| 3510 | 177.042 |
| 3511 | 177.454 |
| 3512 | 177.194 |
| 3513 | 178.374 |
| 3514 | 180.111 |
| 3515 | 181.269 |
| 3516 | 180.574 |
| 3517 | 181.321 |
| 3518 | 180.042 |
| 3519 | 179.979 |
| 3520 | 179.587 |
| 3521 | 179.776 |
| 3522 | 180.308 |
| 3523 | 178.648 |
| 3524 | 180.329 |
| 3525 | 180.606 |
| 3526 | 178.56 |
| 3527 | 179.218 |
| 3528 | 180.959 |
| 3529 | 181.715 |
| 3530 | 181.784 |
| 3531 | 181.557 |
| 3532 | 181.432 |
| 3533 | 182.054 |
| 3534 | 183.273 |
| 3535 | 183.149 |
| 3536 | 184.084 |
| 3537 | 185.235 |
| 3538 | 186.649 |
| 3539 | 186.773 |
| 3540 | 188.603 |
| 3541 | 188.339 |
| 3542 | 190.343 |
| 3543 | 192.064 |
| 3544 | 190.631 |
| 3545 | 189.711 |
| 3546 | 189.065 |
| 3547 | 188.844 |
| 3548 | 189.964 |
| 3549 | 188.126 |
| 3550 | 189.643 |
| 3551 | 191.087 |
| 3552 | 190.531 |
| 3553 | 188.938 |
| 3554 | 189.377 |
| 3555 | 190.105 |
| 3556 | 190.264 |
| 3557 | 190.986 |
| 3558 | 192.565 |
| 3559 | 193.108 |
| 3560 | 194.397 |
| 3561 | 193.81 |
| 3562 | 195.152 |
| 3563 | 196.838 |
| 3564 | 197.289 |
| 3565 | 196.68 |
| 3566 | 196.757 |
| 3567 | 195.942 |
| 3568 | 197.935 |
| 3569 | 199.579 |
| 3570 | 199.905 |
| 3571 | 200.924 |
| 3572 | 199.647 |
| 3573 | 198.747 |
| 3574 | 200.654 |
| 3575 | 201.861 |
| 3576 | 202.544 |
| 3577 | 200.558 |
| 3578 | 198.606 |
| 3579 | 196.958 |
| 3580 | 198.436 |
| 3581 | 198.656 |
| 3582 | 197.364 |
| 3583 | 198.863 |
| 3584 | 198.514 |
| 3585 | 199.571 |
| 3586 | 199.021 |
| 3587 | 197.639 |
| 3588 | 198.67 |
| 3589 | 197.357 |
| 3590 | 197.624 |
| 3591 | 199.175 |
| 3592 | 199.658 |
| 3593 | 198.707 |
| 3594 | 197.302 |
| 3595 | 199.265 |
| 3596 | 201.251 |
| 3597 | 201.829 |
| 3598 | 203.381 |
| 3599 | 202.724 |
| 3600 | 204.259 |
| 3601 | 205.69 |
| 3602 | 207.277 |
| 3603 | 206.539 |
| 3604 | 207.965 |
| 3605 | 208.789 |
| 3606 | 210.258 |
| 3607 | 210.981 |
| 3608 | 211.777 |
| 3609 | 210.237 |
| 3610 | 208.356 |
| 3611 | 207.235 |
| 3612 | 206.958 |
| 3613 | 206.96 |
| 3614 | 205.788 |
| 3615 | 207.461 |
| 3616 | 206.844 |
| 3617 | 205.405 |
| 3618 | 204.958 |
| 3619 | 204.765 |
| 3620 | 203.802 |
| 3621 | 202.544 |
| 3622 | 204.483 |
| 3623 | 203.15 |
| 3624 | 201.691 |
| 3625 | 199.795 |
| 3626 | 201.239 |
| 3627 | 202.365 |
| 3628 | 202.42 |
| 3629 | 201.612 |
| 3630 | 201.649 |
| 3631 | 202.534 |
| 3632 | 200.529 |
| 3633 | 199.65 |
| 3634 | 200.274 |
| 3635 | 201.459 |
| 3636 | 199.869 |
| 3637 | 200.074 |
| 3638 | 198.95 |
| 3639 | 199.728 |
| 3640 | 200.233 |
| 3641 | 199.078 |
| 3642 | 199.985 |
| 3643 | 201.745 |
| 3644 | 203.426 |
| 3645 | 204.507 |
| 3646 | 203.455 |
| 3647 | 205.213 |
| 3648 | 203.266 |
| 3649 | 204.172 |
| 3650 | 205.067 |
| 3651 | 204.212 |
| 3652 | 205.578 |
| 3653 | 206.12 |
| 3654 | 204.321 |
| 3655 | 203.957 |
| 3656 | 204.439 |
| 3657 | 204.474 |
| 3658 | 205.574 |
| 3659 | 206.453 |
| 3660 | 206.277 |
| 3661 | 204.589 |
| 3662 | 203.795 |
| 3663 | 204.358 |
| 3664 | 203.122 |
| 3665 | 202.524 |
| 3666 | 203.365 |
| 3667 | 204.039 |
| 3668 | 204.532 |
| 3669 | 205.838 |
| 3670 | 206.37 |
| 3671 | 204.688 |
| 3672 | 203.003 |
| 3673 | 202.742 |
| 3674 | 202.359 |
| 3675 | 201.924 |
| 3676 | 202.307 |
| 3677 | 203.308 |
| 3678 | 202.013 |
| 3679 | 201.583 |
| 3680 | 202.399 |
| 3681 | 203.571 |
| 3682 | 202.229 |
| 3683 | 202.177 |
| 3684 | 201.929 |
| 3685 | 202.436 |
| 3686 | 203.137 |
| 3687 | 203.142 |
| 3688 | 202.348 |
| 3689 | 201.239 |
| 3690 | 201.475 |
| 3691 | 201.866 |
| 3692 | 203.541 |
| 3693 | 201.897 |
| 3694 | 201.663 |
| 3695 | 202.252 |
| 3696 | 200.449 |
| 3697 | 201.838 |
| 3698 | 202.778 |
| 3699 | 203.597 |
| 3700 | 203.566 |
| 3701 | 205.016 |
| 3702 | 204.392 |
| 3703 | 205.923 |
| 3704 | 206.779 |
| 3705 | 207.039 |
| 3706 | 208.337 |
| 3707 | 207.481 |
| 3708 | 207.42 |
| 3709 | 206.387 |
| 3710 | 206.178 |
| 3711 | 205.439 |
| 3712 | 203.614 |
| 3713 | 204.581 |
| 3714 | 205.749 |
| 3715 | 205.011 |
| 3716 | 205.917 |
| 3717 | 206.753 |
| 3718 | 204.922 |
| 3719 | 205.932 |
| 3720 | 207.622 |
| 3721 | 208.347 |
| 3722 | 208.81 |
| 3723 | 208.815 |
| 3724 | 208.954 |
| 3725 | 209.503 |
| 3726 | 208.665 |
| 3727 | 207.072 |
| 3728 | 208.642 |
| 3729 | 210.5 |
| 3730 | 212.298 |
| 3731 | 213.948 |
| 3732 | 212.6 |
| 3733 | 212.427 |
| 3734 | 213.446 |
| 3735 | 214.554 |
| 3736 | 214.939 |
| 3737 | 215.583 |
| 3738 | 217.339 |
| 3739 | 216.166 |
| 3740 | 217.368 |
| 3741 | 216.298 |
| 3742 | 215.093 |
| 3743 | 215.378 |
| 3744 | 217.014 |
| 3745 | 216.256 |
| 3746 | 217.102 |
| 3747 | 219.05 |
| 3748 | 218.605 |
| 3749 | 219.749 |
| 3750 | 219.478 |
| 3751 | 218.18 |
| 3752 | 219.542 |
| 3753 | 219.101 |
| 3754 | 218.758 |
| 3755 | 218.424 |
| 3756 | 220.127 |
| 3757 | 221.62 |
| 3758 | 220.554 |
| 3759 | 220.782 |
| 3760 | 220.475 |
| 3761 | 221.039 |
| 3762 | 220.121 |
| 3763 | 219.225 |
| 3764 | 220.825 |
| 3765 | 222.642 |
| 3766 | 221.921 |
| 3767 | 221.565 |
| 3768 | 222.69 |
| 3769 | 224.448 |
| 3770 | 223.598 |
| 3771 | 224.282 |
| 3772 | 225.913 |
| 3773 | 224.732 |
| 3774 | 225.778 |
| 3775 | 226.348 |
| 3776 | 225.813 |
| 3777 | 225.536 |
| 3778 | 224.118 |
| 3779 | 224.421 |
| 3780 | 223.168 |
| 3781 | 224.586 |
| 3782 | 226.423 |
| 3783 | 227.277 |
| 3784 | 229.045 |
| 3785 | 229.414 |
| 3786 | 228.893 |
| 3787 | 229.382 |
| 3788 | 228.127 |
| 3789 | 229.054 |
| 3790 | 230.455 |
| 3791 | 230.277 |
| 3792 | 230.647 |
| 3793 | 230.061 |
| 3794 | 228.718 |
| 3795 | 230.172 |
| 3796 | 229.419 |
| 3797 | 230.887 |
| 3798 | 231.48 |
| 3799 | 229.608 |
| 3800 | 227.83 |
| 3801 | 227.542 |
| 3802 | 226.043 |
| 3803 | 224.704 |
| 3804 | 226.054 |
| 3805 | 225.538 |
| 3806 | 226.66 |
| 3807 | 228.353 |
| 3808 | 228.567 |
| 3809 | 230.151 |
| 3810 | 229.665 |
| 3811 | 227.811 |
| 3812 | 227.828 |
| 3813 | 227.892 |
| 3814 | 229.191 |
| 3815 | 228.405 |
| 3816 | 230.213 |
| 3817 | 229.01 |
| 3818 | 227.936 |
| 3819 | 227.355 |
| 3820 | 225.555 |
| 3821 | 224.041 |
| 3822 | 224.153 |
| 3823 | 222.339 |
| 3824 | 220.487 |
| 3825 | 219.469 |
| 3826 | 220.572 |
| 3827 | 219.498 |
| 3828 | 218.224 |
| 3829 | 217.853 |
| 3830 | 216.793 |
| 3831 | 216.561 |
| 3832 | 218.271 |
| 3833 | 219.468 |
| 3834 | 219.975 |
| 3835 | 217.973 |
| 3836 | 217.2 |
| 3837 | 215.481 |
| 3838 | 214.073 |
| 3839 | 214.647 |
| 3840 | 213.82 |
| 3841 | 214.034 |
| 3842 | 215.969 |
| 3843 | 217.36 |
| 3844 | 215.775 |
| 3845 | 217.786 |
| 3846 | 218.264 |
| 3847 | 218.976 |
| 3848 | 218.573 |
| 3849 | 219.285 |
| 3850 | 220.695 |
| 3851 | 219.957 |
| 3852 | 221.215 |
| 3853 | 219.456 |
| 3854 | 218.677 |
| 3855 | 217.039 |
| 3856 | 219.035 |
| 3857 | 220.224 |
| 3858 | 218.25 |
| 3859 | 219.052 |
| 3860 | 219.661 |
| 3861 | 219.407 |
| 3862 | 218.268 |
| 3863 | 219.863 |
| 3864 | 219.939 |
| 3865 | 218.247 |
| 3866 | 218.314 |
| 3867 | 216.569 |
| 3868 | 216.236 |
| 3869 | 215.54 |
| 3870 | 217.2 |
| 3871 | 218.013 |
| 3872 | 216.59 |
| 3873 | 215.83 |
| 3874 | 214.269 |
| 3875 | 213.409 |
| 3876 | 214.934 |
| 3877 | 215.548 |
| 3878 | 214.467 |
| 3879 | 212.715 |
| 3880 | 210.722 |
| 3881 | 210.333 |
| 3882 | 212.081 |
| 3883 | 210.787 |
| 3884 | 211.838 |
| 3885 | 213.409 |
| 3886 | 211.943 |
| 3887 | 211.904 |
| 3888 | 213.201 |
| 3889 | 212.056 |
| 3890 | 212.89 |
| 3891 | 211.749 |
| 3892 | 212.21 |
| 3893 | 211.009 |
| 3894 | 211.607 |
| 3895 | 212.422 |
| 3896 | 212.293 |
| 3897 | 214.152 |
| 3898 | 214.743 |
| 3899 | 216.772 |
| 3900 | 217.048 |
| 3901 | 216.126 |
| 3902 | 214.389 |
| 3903 | 213.002 |
| 3904 | 214.105 |
| 3905 | 212.939 |
| 3906 | 213.668 |
| 3907 | 213.358 |
| 3908 | 212.835 |
| 3909 | 211.813 |
| 3910 | 209.971 |
| 3911 | 211.309 |
| 3912 | 212.932 |
| 3913 | 213.842 |
| 3914 | 215.654 |
| 3915 | 216.28 |
| 3916 | 217.696 |
| 3917 | 217.037 |
| 3918 | 218.306 |
| 3919 | 218.605 |
| 3920 | 218.704 |
| 3921 | 218.739 |
| 3922 | 218.106 |
| 3923 | 216.866 |
| 3924 | 216.919 |
| 3925 | 217.847 |
| 3926 | 218.411 |
| 3927 | 219.176 |
| 3928 | 218.924 |
| 3929 | 220.139 |
| 3930 | 218.87 |
| 3931 | 220.476 |
| 3932 | 221.758 |
| 3933 | 222.946 |
| 3934 | 224.497 |
| 3935 | 222.899 |
| 3936 | 224.212 |
| 3937 | 225.914 |
| 3938 | 224.603 |
| 3939 | 224.343 |
| 3940 | 222.861 |
| 3941 | 221.683 |
| 3942 | 222.528 |
| 3943 | 222.861 |
| 3944 | 222.287 |
| 3945 | 222.544 |
| 3946 | 222.874 |
| 3947 | 224.536 |
| 3948 | 223.533 |
| 3949 | 223.352 |
| 3950 | 221.679 |
| 3951 | 221.149 |
| 3952 | 221.152 |
| 3953 | 222.383 |
| 3954 | 222.84 |
| 3955 | 221.281 |
| 3956 | 219.421 |
| 3957 | 219.614 |
| 3958 | 219.092 |
| 3959 | 217.48 |
| 3960 | 216.989 |
| 3961 | 215.4 |
| 3962 | 216.299 |
| 3963 | 214.734 |
| 3964 | 213.78 |
| 3965 | 213.042 |
| 3966 | 213.84 |
| 3967 | 212.287 |
| 3968 | 211.91 |
| 3969 | 211.459 |
| 3970 | 210.516 |
| 3971 | 208.624 |
| 3972 | 207.563 |
| 3973 | 207.486 |
| 3974 | 208.56 |
| 3975 | 209.164 |
| 3976 | 207.242 |
| 3977 | 208.495 |
| 3978 | 207.345 |
| 3979 | 205.946 |
| 3980 | 204.505 |
| 3981 | 206.28 |
| 3982 | 206.775 |
| 3983 | 208.138 |
| 3984 | 207.703 |
| 3985 | 206.33 |
| 3986 | 206.873 |
| 3987 | 206.047 |
| 3988 | 204.35 |
| 3989 | 203.077 |
| 3990 | 203.194 |
| 3991 | 201.762 |
| 3992 | 201.227 |
| 3993 | 200.841 |
| 3994 | 201.141 |
| 3995 | 202.517 |
| 3996 | 201.081 |
| 3997 | 201.174 |
| 3998 | 201.801 |
| 3999 | 203.335 |
| 4000 | 205.311 |
| 4001 | 204.5 |
| 4002 | 205.024 |
| 4003 | 206.644 |
| 4004 | 204.837 |
| 4005 | 203.222 |
| 4006 | 205.219 |
| 4007 | 203.501 |
| 4008 | 203.113 |
| 4009 | 204.542 |
| 4010 | 206.104 |
| 4011 | 204.476 |
| 4012 | 204.09 |
| 4013 | 205.651 |
| 4014 | 204.926 |
| 4015 | 204.784 |
| 4016 | 204.906 |
| 4017 | 203.634 |
| 4018 | 203.371 |
| 4019 | 202.843 |
| 4020 | 201.359 |
| 4021 | 202.029 |
| 4022 | 203.35 |
| 4023 | 203.162 |
| 4024 | 205.048 |
| 4025 | 206.763 |
| 4026 | 206.381 |
| 4027 | 204.752 |
| 4028 | 202.987 |
| 4029 | 201.527 |
| 4030 | 201.957 |
| 4031 | 203.311 |
| 4032 | 202.729 |
| 4033 | 203.191 |
| 4034 | 201.479 |